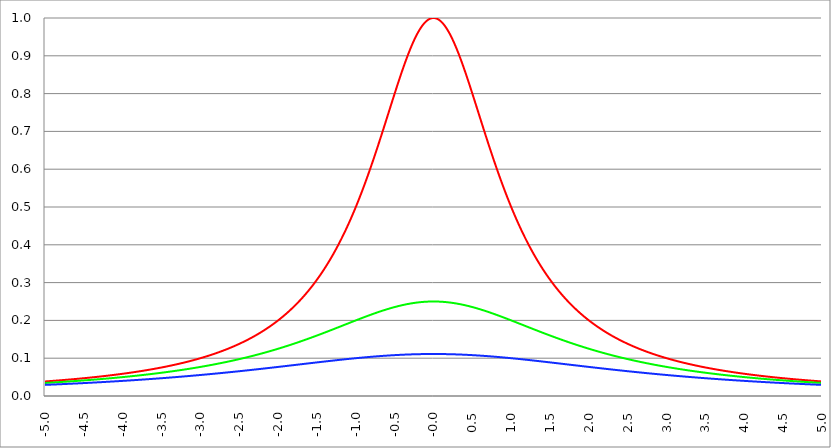
| Category | Series 1 | Series 0 | Series 2 |
|---|---|---|---|
| -5.0 | 0.038 | 0.034 | 0.029 |
| -4.995 | 0.039 | 0.035 | 0.029 |
| -4.99 | 0.039 | 0.035 | 0.029 |
| -4.985 | 0.039 | 0.035 | 0.03 |
| -4.98 | 0.039 | 0.035 | 0.03 |
| -4.975 | 0.039 | 0.035 | 0.03 |
| -4.97 | 0.039 | 0.035 | 0.03 |
| -4.965000000000001 | 0.039 | 0.035 | 0.03 |
| -4.960000000000001 | 0.039 | 0.035 | 0.03 |
| -4.955000000000001 | 0.039 | 0.035 | 0.03 |
| -4.950000000000001 | 0.039 | 0.035 | 0.03 |
| -4.945000000000001 | 0.039 | 0.035 | 0.03 |
| -4.940000000000001 | 0.039 | 0.035 | 0.03 |
| -4.935000000000001 | 0.039 | 0.035 | 0.03 |
| -4.930000000000001 | 0.04 | 0.035 | 0.03 |
| -4.925000000000002 | 0.04 | 0.035 | 0.03 |
| -4.920000000000002 | 0.04 | 0.035 | 0.03 |
| -4.915000000000002 | 0.04 | 0.036 | 0.03 |
| -4.910000000000002 | 0.04 | 0.036 | 0.03 |
| -4.905000000000002 | 0.04 | 0.036 | 0.03 |
| -4.900000000000002 | 0.04 | 0.036 | 0.03 |
| -4.895000000000002 | 0.04 | 0.036 | 0.03 |
| -4.890000000000002 | 0.04 | 0.036 | 0.03 |
| -4.885000000000002 | 0.04 | 0.036 | 0.03 |
| -4.880000000000002 | 0.04 | 0.036 | 0.03 |
| -4.875000000000003 | 0.04 | 0.036 | 0.031 |
| -4.870000000000003 | 0.04 | 0.036 | 0.031 |
| -4.865000000000003 | 0.041 | 0.036 | 0.031 |
| -4.860000000000003 | 0.041 | 0.036 | 0.031 |
| -4.855000000000003 | 0.041 | 0.036 | 0.031 |
| -4.850000000000003 | 0.041 | 0.036 | 0.031 |
| -4.845000000000003 | 0.041 | 0.036 | 0.031 |
| -4.840000000000003 | 0.041 | 0.036 | 0.031 |
| -4.835000000000003 | 0.041 | 0.037 | 0.031 |
| -4.830000000000004 | 0.041 | 0.037 | 0.031 |
| -4.825000000000004 | 0.041 | 0.037 | 0.031 |
| -4.820000000000004 | 0.041 | 0.037 | 0.031 |
| -4.815000000000004 | 0.041 | 0.037 | 0.031 |
| -4.810000000000004 | 0.041 | 0.037 | 0.031 |
| -4.805000000000004 | 0.042 | 0.037 | 0.031 |
| -4.800000000000004 | 0.042 | 0.037 | 0.031 |
| -4.795000000000004 | 0.042 | 0.037 | 0.031 |
| -4.790000000000004 | 0.042 | 0.037 | 0.031 |
| -4.785000000000004 | 0.042 | 0.037 | 0.031 |
| -4.780000000000004 | 0.042 | 0.037 | 0.031 |
| -4.775000000000004 | 0.042 | 0.037 | 0.031 |
| -4.770000000000004 | 0.042 | 0.037 | 0.031 |
| -4.765000000000005 | 0.042 | 0.037 | 0.032 |
| -4.760000000000005 | 0.042 | 0.038 | 0.032 |
| -4.755000000000005 | 0.042 | 0.038 | 0.032 |
| -4.750000000000005 | 0.042 | 0.038 | 0.032 |
| -4.745000000000005 | 0.043 | 0.038 | 0.032 |
| -4.740000000000005 | 0.043 | 0.038 | 0.032 |
| -4.735000000000005 | 0.043 | 0.038 | 0.032 |
| -4.730000000000005 | 0.043 | 0.038 | 0.032 |
| -4.725000000000006 | 0.043 | 0.038 | 0.032 |
| -4.720000000000006 | 0.043 | 0.038 | 0.032 |
| -4.715000000000006 | 0.043 | 0.038 | 0.032 |
| -4.710000000000006 | 0.043 | 0.038 | 0.032 |
| -4.705000000000006 | 0.043 | 0.038 | 0.032 |
| -4.700000000000006 | 0.043 | 0.038 | 0.032 |
| -4.695000000000006 | 0.043 | 0.038 | 0.032 |
| -4.690000000000006 | 0.043 | 0.038 | 0.032 |
| -4.685000000000007 | 0.044 | 0.039 | 0.032 |
| -4.680000000000007 | 0.044 | 0.039 | 0.032 |
| -4.675000000000007 | 0.044 | 0.039 | 0.032 |
| -4.670000000000007 | 0.044 | 0.039 | 0.032 |
| -4.665000000000007 | 0.044 | 0.039 | 0.033 |
| -4.660000000000007 | 0.044 | 0.039 | 0.033 |
| -4.655000000000007 | 0.044 | 0.039 | 0.033 |
| -4.650000000000007 | 0.044 | 0.039 | 0.033 |
| -4.645000000000007 | 0.044 | 0.039 | 0.033 |
| -4.640000000000008 | 0.044 | 0.039 | 0.033 |
| -4.635000000000008 | 0.044 | 0.039 | 0.033 |
| -4.630000000000008 | 0.045 | 0.039 | 0.033 |
| -4.625000000000008 | 0.045 | 0.039 | 0.033 |
| -4.620000000000008 | 0.045 | 0.039 | 0.033 |
| -4.615000000000008 | 0.045 | 0.04 | 0.033 |
| -4.610000000000008 | 0.045 | 0.04 | 0.033 |
| -4.605000000000008 | 0.045 | 0.04 | 0.033 |
| -4.600000000000008 | 0.045 | 0.04 | 0.033 |
| -4.595000000000009 | 0.045 | 0.04 | 0.033 |
| -4.590000000000009 | 0.045 | 0.04 | 0.033 |
| -4.585000000000009 | 0.045 | 0.04 | 0.033 |
| -4.580000000000009 | 0.046 | 0.04 | 0.033 |
| -4.57500000000001 | 0.046 | 0.04 | 0.033 |
| -4.57000000000001 | 0.046 | 0.04 | 0.033 |
| -4.565000000000009 | 0.046 | 0.04 | 0.034 |
| -4.560000000000009 | 0.046 | 0.04 | 0.034 |
| -4.555000000000009 | 0.046 | 0.04 | 0.034 |
| -4.55000000000001 | 0.046 | 0.04 | 0.034 |
| -4.54500000000001 | 0.046 | 0.041 | 0.034 |
| -4.54000000000001 | 0.046 | 0.041 | 0.034 |
| -4.53500000000001 | 0.046 | 0.041 | 0.034 |
| -4.53000000000001 | 0.046 | 0.041 | 0.034 |
| -4.52500000000001 | 0.047 | 0.041 | 0.034 |
| -4.52000000000001 | 0.047 | 0.041 | 0.034 |
| -4.51500000000001 | 0.047 | 0.041 | 0.034 |
| -4.51000000000001 | 0.047 | 0.041 | 0.034 |
| -4.505000000000011 | 0.047 | 0.041 | 0.034 |
| -4.500000000000011 | 0.047 | 0.041 | 0.034 |
| -4.495000000000011 | 0.047 | 0.041 | 0.034 |
| -4.490000000000011 | 0.047 | 0.041 | 0.034 |
| -4.485000000000011 | 0.047 | 0.041 | 0.034 |
| -4.480000000000011 | 0.047 | 0.042 | 0.034 |
| -4.475000000000011 | 0.048 | 0.042 | 0.034 |
| -4.470000000000011 | 0.048 | 0.042 | 0.035 |
| -4.465000000000011 | 0.048 | 0.042 | 0.035 |
| -4.460000000000011 | 0.048 | 0.042 | 0.035 |
| -4.455000000000012 | 0.048 | 0.042 | 0.035 |
| -4.450000000000012 | 0.048 | 0.042 | 0.035 |
| -4.445000000000012 | 0.048 | 0.042 | 0.035 |
| -4.440000000000012 | 0.048 | 0.042 | 0.035 |
| -4.435000000000012 | 0.048 | 0.042 | 0.035 |
| -4.430000000000012 | 0.048 | 0.042 | 0.035 |
| -4.425000000000012 | 0.049 | 0.042 | 0.035 |
| -4.420000000000012 | 0.049 | 0.042 | 0.035 |
| -4.415000000000012 | 0.049 | 0.043 | 0.035 |
| -4.410000000000013 | 0.049 | 0.043 | 0.035 |
| -4.405000000000013 | 0.049 | 0.043 | 0.035 |
| -4.400000000000013 | 0.049 | 0.043 | 0.035 |
| -4.395000000000013 | 0.049 | 0.043 | 0.035 |
| -4.390000000000013 | 0.049 | 0.043 | 0.035 |
| -4.385000000000013 | 0.049 | 0.043 | 0.035 |
| -4.380000000000013 | 0.05 | 0.043 | 0.035 |
| -4.375000000000013 | 0.05 | 0.043 | 0.036 |
| -4.370000000000013 | 0.05 | 0.043 | 0.036 |
| -4.365000000000013 | 0.05 | 0.043 | 0.036 |
| -4.360000000000014 | 0.05 | 0.043 | 0.036 |
| -4.355000000000014 | 0.05 | 0.044 | 0.036 |
| -4.350000000000014 | 0.05 | 0.044 | 0.036 |
| -4.345000000000014 | 0.05 | 0.044 | 0.036 |
| -4.340000000000014 | 0.05 | 0.044 | 0.036 |
| -4.335000000000014 | 0.051 | 0.044 | 0.036 |
| -4.330000000000014 | 0.051 | 0.044 | 0.036 |
| -4.325000000000014 | 0.051 | 0.044 | 0.036 |
| -4.320000000000014 | 0.051 | 0.044 | 0.036 |
| -4.315000000000015 | 0.051 | 0.044 | 0.036 |
| -4.310000000000015 | 0.051 | 0.044 | 0.036 |
| -4.305000000000015 | 0.051 | 0.044 | 0.036 |
| -4.300000000000015 | 0.051 | 0.044 | 0.036 |
| -4.295000000000015 | 0.051 | 0.045 | 0.036 |
| -4.290000000000015 | 0.052 | 0.045 | 0.036 |
| -4.285000000000015 | 0.052 | 0.045 | 0.037 |
| -4.280000000000015 | 0.052 | 0.045 | 0.037 |
| -4.275000000000015 | 0.052 | 0.045 | 0.037 |
| -4.270000000000015 | 0.052 | 0.045 | 0.037 |
| -4.265000000000016 | 0.052 | 0.045 | 0.037 |
| -4.260000000000016 | 0.052 | 0.045 | 0.037 |
| -4.255000000000016 | 0.052 | 0.045 | 0.037 |
| -4.250000000000016 | 0.052 | 0.045 | 0.037 |
| -4.245000000000016 | 0.053 | 0.045 | 0.037 |
| -4.240000000000016 | 0.053 | 0.046 | 0.037 |
| -4.235000000000016 | 0.053 | 0.046 | 0.037 |
| -4.230000000000016 | 0.053 | 0.046 | 0.037 |
| -4.225000000000017 | 0.053 | 0.046 | 0.037 |
| -4.220000000000017 | 0.053 | 0.046 | 0.037 |
| -4.215000000000017 | 0.053 | 0.046 | 0.037 |
| -4.210000000000017 | 0.053 | 0.046 | 0.037 |
| -4.205000000000017 | 0.054 | 0.046 | 0.037 |
| -4.200000000000017 | 0.054 | 0.046 | 0.038 |
| -4.195000000000017 | 0.054 | 0.046 | 0.038 |
| -4.190000000000017 | 0.054 | 0.046 | 0.038 |
| -4.185000000000017 | 0.054 | 0.046 | 0.038 |
| -4.180000000000017 | 0.054 | 0.047 | 0.038 |
| -4.175000000000018 | 0.054 | 0.047 | 0.038 |
| -4.170000000000018 | 0.054 | 0.047 | 0.038 |
| -4.165000000000018 | 0.055 | 0.047 | 0.038 |
| -4.160000000000018 | 0.055 | 0.047 | 0.038 |
| -4.155000000000018 | 0.055 | 0.047 | 0.038 |
| -4.150000000000018 | 0.055 | 0.047 | 0.038 |
| -4.145000000000018 | 0.055 | 0.047 | 0.038 |
| -4.140000000000018 | 0.055 | 0.047 | 0.038 |
| -4.135000000000018 | 0.055 | 0.047 | 0.038 |
| -4.130000000000019 | 0.055 | 0.047 | 0.038 |
| -4.125000000000019 | 0.056 | 0.048 | 0.038 |
| -4.120000000000019 | 0.056 | 0.048 | 0.038 |
| -4.115000000000019 | 0.056 | 0.048 | 0.039 |
| -4.110000000000019 | 0.056 | 0.048 | 0.039 |
| -4.105000000000019 | 0.056 | 0.048 | 0.039 |
| -4.100000000000019 | 0.056 | 0.048 | 0.039 |
| -4.095000000000019 | 0.056 | 0.048 | 0.039 |
| -4.090000000000019 | 0.056 | 0.048 | 0.039 |
| -4.085000000000019 | 0.057 | 0.048 | 0.039 |
| -4.08000000000002 | 0.057 | 0.048 | 0.039 |
| -4.07500000000002 | 0.057 | 0.049 | 0.039 |
| -4.07000000000002 | 0.057 | 0.049 | 0.039 |
| -4.06500000000002 | 0.057 | 0.049 | 0.039 |
| -4.06000000000002 | 0.057 | 0.049 | 0.039 |
| -4.05500000000002 | 0.057 | 0.049 | 0.039 |
| -4.05000000000002 | 0.057 | 0.049 | 0.039 |
| -4.04500000000002 | 0.058 | 0.049 | 0.039 |
| -4.04000000000002 | 0.058 | 0.049 | 0.039 |
| -4.03500000000002 | 0.058 | 0.049 | 0.04 |
| -4.03000000000002 | 0.058 | 0.049 | 0.04 |
| -4.025000000000021 | 0.058 | 0.05 | 0.04 |
| -4.020000000000021 | 0.058 | 0.05 | 0.04 |
| -4.015000000000021 | 0.058 | 0.05 | 0.04 |
| -4.010000000000021 | 0.059 | 0.05 | 0.04 |
| -4.005000000000021 | 0.059 | 0.05 | 0.04 |
| -4.000000000000021 | 0.059 | 0.05 | 0.04 |
| -3.995000000000021 | 0.059 | 0.05 | 0.04 |
| -3.990000000000021 | 0.059 | 0.05 | 0.04 |
| -3.985000000000022 | 0.059 | 0.05 | 0.04 |
| -3.980000000000022 | 0.059 | 0.05 | 0.04 |
| -3.975000000000022 | 0.06 | 0.051 | 0.04 |
| -3.970000000000022 | 0.06 | 0.051 | 0.04 |
| -3.965000000000022 | 0.06 | 0.051 | 0.04 |
| -3.960000000000022 | 0.06 | 0.051 | 0.041 |
| -3.955000000000022 | 0.06 | 0.051 | 0.041 |
| -3.950000000000022 | 0.06 | 0.051 | 0.041 |
| -3.945000000000022 | 0.06 | 0.051 | 0.041 |
| -3.940000000000023 | 0.061 | 0.051 | 0.041 |
| -3.935000000000023 | 0.061 | 0.051 | 0.041 |
| -3.930000000000023 | 0.061 | 0.051 | 0.041 |
| -3.925000000000023 | 0.061 | 0.052 | 0.041 |
| -3.920000000000023 | 0.061 | 0.052 | 0.041 |
| -3.915000000000023 | 0.061 | 0.052 | 0.041 |
| -3.910000000000023 | 0.061 | 0.052 | 0.041 |
| -3.905000000000023 | 0.062 | 0.052 | 0.041 |
| -3.900000000000023 | 0.062 | 0.052 | 0.041 |
| -3.895000000000023 | 0.062 | 0.052 | 0.041 |
| -3.890000000000024 | 0.062 | 0.052 | 0.041 |
| -3.885000000000024 | 0.062 | 0.052 | 0.042 |
| -3.880000000000024 | 0.062 | 0.052 | 0.042 |
| -3.875000000000024 | 0.062 | 0.053 | 0.042 |
| -3.870000000000024 | 0.063 | 0.053 | 0.042 |
| -3.865000000000024 | 0.063 | 0.053 | 0.042 |
| -3.860000000000024 | 0.063 | 0.053 | 0.042 |
| -3.855000000000024 | 0.063 | 0.053 | 0.042 |
| -3.850000000000024 | 0.063 | 0.053 | 0.042 |
| -3.845000000000025 | 0.063 | 0.053 | 0.042 |
| -3.840000000000025 | 0.064 | 0.053 | 0.042 |
| -3.835000000000025 | 0.064 | 0.053 | 0.042 |
| -3.830000000000025 | 0.064 | 0.054 | 0.042 |
| -3.825000000000025 | 0.064 | 0.054 | 0.042 |
| -3.820000000000025 | 0.064 | 0.054 | 0.042 |
| -3.815000000000025 | 0.064 | 0.054 | 0.042 |
| -3.810000000000025 | 0.064 | 0.054 | 0.043 |
| -3.805000000000025 | 0.065 | 0.054 | 0.043 |
| -3.800000000000026 | 0.065 | 0.054 | 0.043 |
| -3.795000000000026 | 0.065 | 0.054 | 0.043 |
| -3.790000000000026 | 0.065 | 0.054 | 0.043 |
| -3.785000000000026 | 0.065 | 0.055 | 0.043 |
| -3.780000000000026 | 0.065 | 0.055 | 0.043 |
| -3.775000000000026 | 0.066 | 0.055 | 0.043 |
| -3.770000000000026 | 0.066 | 0.055 | 0.043 |
| -3.765000000000026 | 0.066 | 0.055 | 0.043 |
| -3.760000000000026 | 0.066 | 0.055 | 0.043 |
| -3.755000000000026 | 0.066 | 0.055 | 0.043 |
| -3.750000000000027 | 0.066 | 0.055 | 0.043 |
| -3.745000000000027 | 0.067 | 0.055 | 0.043 |
| -3.740000000000027 | 0.067 | 0.056 | 0.044 |
| -3.735000000000027 | 0.067 | 0.056 | 0.044 |
| -3.730000000000027 | 0.067 | 0.056 | 0.044 |
| -3.725000000000027 | 0.067 | 0.056 | 0.044 |
| -3.720000000000027 | 0.067 | 0.056 | 0.044 |
| -3.715000000000027 | 0.068 | 0.056 | 0.044 |
| -3.710000000000027 | 0.068 | 0.056 | 0.044 |
| -3.705000000000028 | 0.068 | 0.056 | 0.044 |
| -3.700000000000028 | 0.068 | 0.057 | 0.044 |
| -3.695000000000028 | 0.068 | 0.057 | 0.044 |
| -3.690000000000028 | 0.068 | 0.057 | 0.044 |
| -3.685000000000028 | 0.069 | 0.057 | 0.044 |
| -3.680000000000028 | 0.069 | 0.057 | 0.044 |
| -3.675000000000028 | 0.069 | 0.057 | 0.044 |
| -3.670000000000028 | 0.069 | 0.057 | 0.045 |
| -3.665000000000028 | 0.069 | 0.057 | 0.045 |
| -3.660000000000028 | 0.069 | 0.057 | 0.045 |
| -3.655000000000029 | 0.07 | 0.058 | 0.045 |
| -3.650000000000029 | 0.07 | 0.058 | 0.045 |
| -3.645000000000029 | 0.07 | 0.058 | 0.045 |
| -3.640000000000029 | 0.07 | 0.058 | 0.045 |
| -3.635000000000029 | 0.07 | 0.058 | 0.045 |
| -3.630000000000029 | 0.071 | 0.058 | 0.045 |
| -3.625000000000029 | 0.071 | 0.058 | 0.045 |
| -3.620000000000029 | 0.071 | 0.058 | 0.045 |
| -3.615000000000029 | 0.071 | 0.059 | 0.045 |
| -3.61000000000003 | 0.071 | 0.059 | 0.045 |
| -3.60500000000003 | 0.071 | 0.059 | 0.045 |
| -3.60000000000003 | 0.072 | 0.059 | 0.046 |
| -3.59500000000003 | 0.072 | 0.059 | 0.046 |
| -3.59000000000003 | 0.072 | 0.059 | 0.046 |
| -3.58500000000003 | 0.072 | 0.059 | 0.046 |
| -3.58000000000003 | 0.072 | 0.059 | 0.046 |
| -3.57500000000003 | 0.073 | 0.06 | 0.046 |
| -3.57000000000003 | 0.073 | 0.06 | 0.046 |
| -3.565000000000031 | 0.073 | 0.06 | 0.046 |
| -3.560000000000031 | 0.073 | 0.06 | 0.046 |
| -3.555000000000031 | 0.073 | 0.06 | 0.046 |
| -3.550000000000031 | 0.074 | 0.06 | 0.046 |
| -3.545000000000031 | 0.074 | 0.06 | 0.046 |
| -3.540000000000031 | 0.074 | 0.06 | 0.046 |
| -3.535000000000031 | 0.074 | 0.061 | 0.047 |
| -3.530000000000031 | 0.074 | 0.061 | 0.047 |
| -3.525000000000031 | 0.074 | 0.061 | 0.047 |
| -3.520000000000032 | 0.075 | 0.061 | 0.047 |
| -3.515000000000032 | 0.075 | 0.061 | 0.047 |
| -3.510000000000032 | 0.075 | 0.061 | 0.047 |
| -3.505000000000032 | 0.075 | 0.061 | 0.047 |
| -3.500000000000032 | 0.075 | 0.062 | 0.047 |
| -3.495000000000032 | 0.076 | 0.062 | 0.047 |
| -3.490000000000032 | 0.076 | 0.062 | 0.047 |
| -3.485000000000032 | 0.076 | 0.062 | 0.047 |
| -3.480000000000032 | 0.076 | 0.062 | 0.047 |
| -3.475000000000032 | 0.076 | 0.062 | 0.047 |
| -3.470000000000033 | 0.077 | 0.062 | 0.048 |
| -3.465000000000033 | 0.077 | 0.062 | 0.048 |
| -3.460000000000033 | 0.077 | 0.063 | 0.048 |
| -3.455000000000033 | 0.077 | 0.063 | 0.048 |
| -3.450000000000033 | 0.078 | 0.063 | 0.048 |
| -3.445000000000033 | 0.078 | 0.063 | 0.048 |
| -3.440000000000033 | 0.078 | 0.063 | 0.048 |
| -3.435000000000033 | 0.078 | 0.063 | 0.048 |
| -3.430000000000033 | 0.078 | 0.063 | 0.048 |
| -3.425000000000034 | 0.079 | 0.064 | 0.048 |
| -3.420000000000034 | 0.079 | 0.064 | 0.048 |
| -3.415000000000034 | 0.079 | 0.064 | 0.048 |
| -3.410000000000034 | 0.079 | 0.064 | 0.048 |
| -3.405000000000034 | 0.079 | 0.064 | 0.049 |
| -3.400000000000034 | 0.08 | 0.064 | 0.049 |
| -3.395000000000034 | 0.08 | 0.064 | 0.049 |
| -3.390000000000034 | 0.08 | 0.065 | 0.049 |
| -3.385000000000034 | 0.08 | 0.065 | 0.049 |
| -3.380000000000034 | 0.08 | 0.065 | 0.049 |
| -3.375000000000035 | 0.081 | 0.065 | 0.049 |
| -3.370000000000035 | 0.081 | 0.065 | 0.049 |
| -3.365000000000035 | 0.081 | 0.065 | 0.049 |
| -3.360000000000035 | 0.081 | 0.065 | 0.049 |
| -3.355000000000035 | 0.082 | 0.066 | 0.049 |
| -3.350000000000035 | 0.082 | 0.066 | 0.049 |
| -3.345000000000035 | 0.082 | 0.066 | 0.05 |
| -3.340000000000035 | 0.082 | 0.066 | 0.05 |
| -3.335000000000035 | 0.082 | 0.066 | 0.05 |
| -3.330000000000036 | 0.083 | 0.066 | 0.05 |
| -3.325000000000036 | 0.083 | 0.066 | 0.05 |
| -3.320000000000036 | 0.083 | 0.067 | 0.05 |
| -3.315000000000036 | 0.083 | 0.067 | 0.05 |
| -3.310000000000036 | 0.084 | 0.067 | 0.05 |
| -3.305000000000036 | 0.084 | 0.067 | 0.05 |
| -3.300000000000036 | 0.084 | 0.067 | 0.05 |
| -3.295000000000036 | 0.084 | 0.067 | 0.05 |
| -3.290000000000036 | 0.085 | 0.067 | 0.05 |
| -3.285000000000036 | 0.085 | 0.068 | 0.051 |
| -3.280000000000036 | 0.085 | 0.068 | 0.051 |
| -3.275000000000037 | 0.085 | 0.068 | 0.051 |
| -3.270000000000037 | 0.086 | 0.068 | 0.051 |
| -3.265000000000037 | 0.086 | 0.068 | 0.051 |
| -3.260000000000037 | 0.086 | 0.068 | 0.051 |
| -3.255000000000037 | 0.086 | 0.069 | 0.051 |
| -3.250000000000037 | 0.086 | 0.069 | 0.051 |
| -3.245000000000037 | 0.087 | 0.069 | 0.051 |
| -3.240000000000037 | 0.087 | 0.069 | 0.051 |
| -3.235000000000038 | 0.087 | 0.069 | 0.051 |
| -3.230000000000038 | 0.087 | 0.069 | 0.051 |
| -3.225000000000038 | 0.088 | 0.069 | 0.052 |
| -3.220000000000038 | 0.088 | 0.07 | 0.052 |
| -3.215000000000038 | 0.088 | 0.07 | 0.052 |
| -3.210000000000038 | 0.088 | 0.07 | 0.052 |
| -3.205000000000038 | 0.089 | 0.07 | 0.052 |
| -3.200000000000038 | 0.089 | 0.07 | 0.052 |
| -3.195000000000038 | 0.089 | 0.07 | 0.052 |
| -3.190000000000039 | 0.089 | 0.071 | 0.052 |
| -3.185000000000039 | 0.09 | 0.071 | 0.052 |
| -3.180000000000039 | 0.09 | 0.071 | 0.052 |
| -3.175000000000039 | 0.09 | 0.071 | 0.052 |
| -3.170000000000039 | 0.091 | 0.071 | 0.052 |
| -3.16500000000004 | 0.091 | 0.071 | 0.053 |
| -3.16000000000004 | 0.091 | 0.072 | 0.053 |
| -3.155000000000039 | 0.091 | 0.072 | 0.053 |
| -3.150000000000039 | 0.092 | 0.072 | 0.053 |
| -3.14500000000004 | 0.092 | 0.072 | 0.053 |
| -3.14000000000004 | 0.092 | 0.072 | 0.053 |
| -3.13500000000004 | 0.092 | 0.072 | 0.053 |
| -3.13000000000004 | 0.093 | 0.072 | 0.053 |
| -3.12500000000004 | 0.093 | 0.073 | 0.053 |
| -3.12000000000004 | 0.093 | 0.073 | 0.053 |
| -3.11500000000004 | 0.093 | 0.073 | 0.053 |
| -3.11000000000004 | 0.094 | 0.073 | 0.054 |
| -3.10500000000004 | 0.094 | 0.073 | 0.054 |
| -3.10000000000004 | 0.094 | 0.073 | 0.054 |
| -3.095000000000041 | 0.095 | 0.074 | 0.054 |
| -3.090000000000041 | 0.095 | 0.074 | 0.054 |
| -3.085000000000041 | 0.095 | 0.074 | 0.054 |
| -3.080000000000041 | 0.095 | 0.074 | 0.054 |
| -3.075000000000041 | 0.096 | 0.074 | 0.054 |
| -3.070000000000041 | 0.096 | 0.074 | 0.054 |
| -3.065000000000041 | 0.096 | 0.075 | 0.054 |
| -3.060000000000041 | 0.096 | 0.075 | 0.054 |
| -3.055000000000041 | 0.097 | 0.075 | 0.055 |
| -3.050000000000042 | 0.097 | 0.075 | 0.055 |
| -3.045000000000042 | 0.097 | 0.075 | 0.055 |
| -3.040000000000042 | 0.098 | 0.076 | 0.055 |
| -3.035000000000042 | 0.098 | 0.076 | 0.055 |
| -3.030000000000042 | 0.098 | 0.076 | 0.055 |
| -3.025000000000042 | 0.099 | 0.076 | 0.055 |
| -3.020000000000042 | 0.099 | 0.076 | 0.055 |
| -3.015000000000042 | 0.099 | 0.076 | 0.055 |
| -3.010000000000042 | 0.099 | 0.077 | 0.055 |
| -3.005000000000043 | 0.1 | 0.077 | 0.055 |
| -3.000000000000043 | 0.1 | 0.077 | 0.056 |
| -2.995000000000043 | 0.1 | 0.077 | 0.056 |
| -2.990000000000043 | 0.101 | 0.077 | 0.056 |
| -2.985000000000043 | 0.101 | 0.077 | 0.056 |
| -2.980000000000043 | 0.101 | 0.078 | 0.056 |
| -2.975000000000043 | 0.102 | 0.078 | 0.056 |
| -2.970000000000043 | 0.102 | 0.078 | 0.056 |
| -2.965000000000043 | 0.102 | 0.078 | 0.056 |
| -2.960000000000043 | 0.102 | 0.078 | 0.056 |
| -2.955000000000044 | 0.103 | 0.079 | 0.056 |
| -2.950000000000044 | 0.103 | 0.079 | 0.056 |
| -2.945000000000044 | 0.103 | 0.079 | 0.057 |
| -2.940000000000044 | 0.104 | 0.079 | 0.057 |
| -2.935000000000044 | 0.104 | 0.079 | 0.057 |
| -2.930000000000044 | 0.104 | 0.079 | 0.057 |
| -2.925000000000044 | 0.105 | 0.08 | 0.057 |
| -2.920000000000044 | 0.105 | 0.08 | 0.057 |
| -2.915000000000044 | 0.105 | 0.08 | 0.057 |
| -2.910000000000045 | 0.106 | 0.08 | 0.057 |
| -2.905000000000045 | 0.106 | 0.08 | 0.057 |
| -2.900000000000045 | 0.106 | 0.081 | 0.057 |
| -2.895000000000045 | 0.107 | 0.081 | 0.058 |
| -2.890000000000045 | 0.107 | 0.081 | 0.058 |
| -2.885000000000045 | 0.107 | 0.081 | 0.058 |
| -2.880000000000045 | 0.108 | 0.081 | 0.058 |
| -2.875000000000045 | 0.108 | 0.082 | 0.058 |
| -2.870000000000045 | 0.108 | 0.082 | 0.058 |
| -2.865000000000045 | 0.109 | 0.082 | 0.058 |
| -2.860000000000046 | 0.109 | 0.082 | 0.058 |
| -2.855000000000046 | 0.109 | 0.082 | 0.058 |
| -2.850000000000046 | 0.11 | 0.082 | 0.058 |
| -2.845000000000046 | 0.11 | 0.083 | 0.058 |
| -2.840000000000046 | 0.11 | 0.083 | 0.059 |
| -2.835000000000046 | 0.111 | 0.083 | 0.059 |
| -2.830000000000046 | 0.111 | 0.083 | 0.059 |
| -2.825000000000046 | 0.111 | 0.083 | 0.059 |
| -2.820000000000046 | 0.112 | 0.084 | 0.059 |
| -2.815000000000047 | 0.112 | 0.084 | 0.059 |
| -2.810000000000047 | 0.112 | 0.084 | 0.059 |
| -2.805000000000047 | 0.113 | 0.084 | 0.059 |
| -2.800000000000047 | 0.113 | 0.084 | 0.059 |
| -2.795000000000047 | 0.113 | 0.085 | 0.059 |
| -2.790000000000047 | 0.114 | 0.085 | 0.06 |
| -2.785000000000047 | 0.114 | 0.085 | 0.06 |
| -2.780000000000047 | 0.115 | 0.085 | 0.06 |
| -2.775000000000047 | 0.115 | 0.085 | 0.06 |
| -2.770000000000047 | 0.115 | 0.086 | 0.06 |
| -2.765000000000048 | 0.116 | 0.086 | 0.06 |
| -2.760000000000048 | 0.116 | 0.086 | 0.06 |
| -2.755000000000048 | 0.116 | 0.086 | 0.06 |
| -2.750000000000048 | 0.117 | 0.086 | 0.06 |
| -2.745000000000048 | 0.117 | 0.087 | 0.06 |
| -2.740000000000048 | 0.118 | 0.087 | 0.061 |
| -2.735000000000048 | 0.118 | 0.087 | 0.061 |
| -2.730000000000048 | 0.118 | 0.087 | 0.061 |
| -2.725000000000048 | 0.119 | 0.088 | 0.061 |
| -2.720000000000049 | 0.119 | 0.088 | 0.061 |
| -2.715000000000049 | 0.119 | 0.088 | 0.061 |
| -2.710000000000049 | 0.12 | 0.088 | 0.061 |
| -2.705000000000049 | 0.12 | 0.088 | 0.061 |
| -2.700000000000049 | 0.121 | 0.089 | 0.061 |
| -2.695000000000049 | 0.121 | 0.089 | 0.061 |
| -2.690000000000049 | 0.121 | 0.089 | 0.062 |
| -2.685000000000049 | 0.122 | 0.089 | 0.062 |
| -2.680000000000049 | 0.122 | 0.089 | 0.062 |
| -2.675000000000049 | 0.123 | 0.09 | 0.062 |
| -2.67000000000005 | 0.123 | 0.09 | 0.062 |
| -2.66500000000005 | 0.123 | 0.09 | 0.062 |
| -2.66000000000005 | 0.124 | 0.09 | 0.062 |
| -2.65500000000005 | 0.124 | 0.091 | 0.062 |
| -2.65000000000005 | 0.125 | 0.091 | 0.062 |
| -2.64500000000005 | 0.125 | 0.091 | 0.063 |
| -2.64000000000005 | 0.125 | 0.091 | 0.063 |
| -2.63500000000005 | 0.126 | 0.091 | 0.063 |
| -2.63000000000005 | 0.126 | 0.092 | 0.063 |
| -2.625000000000051 | 0.127 | 0.092 | 0.063 |
| -2.620000000000051 | 0.127 | 0.092 | 0.063 |
| -2.615000000000051 | 0.128 | 0.092 | 0.063 |
| -2.610000000000051 | 0.128 | 0.092 | 0.063 |
| -2.605000000000051 | 0.128 | 0.093 | 0.063 |
| -2.600000000000051 | 0.129 | 0.093 | 0.063 |
| -2.595000000000051 | 0.129 | 0.093 | 0.064 |
| -2.590000000000051 | 0.13 | 0.093 | 0.064 |
| -2.585000000000051 | 0.13 | 0.094 | 0.064 |
| -2.580000000000052 | 0.131 | 0.094 | 0.064 |
| -2.575000000000052 | 0.131 | 0.094 | 0.064 |
| -2.570000000000052 | 0.131 | 0.094 | 0.064 |
| -2.565000000000052 | 0.132 | 0.095 | 0.064 |
| -2.560000000000052 | 0.132 | 0.095 | 0.064 |
| -2.555000000000052 | 0.133 | 0.095 | 0.064 |
| -2.550000000000052 | 0.133 | 0.095 | 0.065 |
| -2.545000000000052 | 0.134 | 0.095 | 0.065 |
| -2.540000000000052 | 0.134 | 0.096 | 0.065 |
| -2.535000000000053 | 0.135 | 0.096 | 0.065 |
| -2.530000000000053 | 0.135 | 0.096 | 0.065 |
| -2.525000000000053 | 0.136 | 0.096 | 0.065 |
| -2.520000000000053 | 0.136 | 0.097 | 0.065 |
| -2.515000000000053 | 0.137 | 0.097 | 0.065 |
| -2.510000000000053 | 0.137 | 0.097 | 0.065 |
| -2.505000000000053 | 0.137 | 0.097 | 0.065 |
| -2.500000000000053 | 0.138 | 0.098 | 0.066 |
| -2.495000000000053 | 0.138 | 0.098 | 0.066 |
| -2.490000000000053 | 0.139 | 0.098 | 0.066 |
| -2.485000000000054 | 0.139 | 0.098 | 0.066 |
| -2.480000000000054 | 0.14 | 0.099 | 0.066 |
| -2.475000000000054 | 0.14 | 0.099 | 0.066 |
| -2.470000000000054 | 0.141 | 0.099 | 0.066 |
| -2.465000000000054 | 0.141 | 0.099 | 0.066 |
| -2.460000000000054 | 0.142 | 0.099 | 0.066 |
| -2.455000000000054 | 0.142 | 0.1 | 0.067 |
| -2.450000000000054 | 0.143 | 0.1 | 0.067 |
| -2.445000000000054 | 0.143 | 0.1 | 0.067 |
| -2.440000000000055 | 0.144 | 0.1 | 0.067 |
| -2.435000000000055 | 0.144 | 0.101 | 0.067 |
| -2.430000000000055 | 0.145 | 0.101 | 0.067 |
| -2.425000000000055 | 0.145 | 0.101 | 0.067 |
| -2.420000000000055 | 0.146 | 0.101 | 0.067 |
| -2.415000000000055 | 0.146 | 0.102 | 0.067 |
| -2.410000000000055 | 0.147 | 0.102 | 0.068 |
| -2.405000000000055 | 0.147 | 0.102 | 0.068 |
| -2.400000000000055 | 0.148 | 0.102 | 0.068 |
| -2.395000000000055 | 0.148 | 0.103 | 0.068 |
| -2.390000000000056 | 0.149 | 0.103 | 0.068 |
| -2.385000000000056 | 0.15 | 0.103 | 0.068 |
| -2.380000000000056 | 0.15 | 0.103 | 0.068 |
| -2.375000000000056 | 0.151 | 0.104 | 0.068 |
| -2.370000000000056 | 0.151 | 0.104 | 0.068 |
| -2.365000000000056 | 0.152 | 0.104 | 0.069 |
| -2.360000000000056 | 0.152 | 0.104 | 0.069 |
| -2.355000000000056 | 0.153 | 0.105 | 0.069 |
| -2.350000000000056 | 0.153 | 0.105 | 0.069 |
| -2.345000000000057 | 0.154 | 0.105 | 0.069 |
| -2.340000000000057 | 0.154 | 0.106 | 0.069 |
| -2.335000000000057 | 0.155 | 0.106 | 0.069 |
| -2.330000000000057 | 0.156 | 0.106 | 0.069 |
| -2.325000000000057 | 0.156 | 0.106 | 0.069 |
| -2.320000000000057 | 0.157 | 0.107 | 0.07 |
| -2.315000000000057 | 0.157 | 0.107 | 0.07 |
| -2.310000000000057 | 0.158 | 0.107 | 0.07 |
| -2.305000000000057 | 0.158 | 0.107 | 0.07 |
| -2.300000000000058 | 0.159 | 0.108 | 0.07 |
| -2.295000000000058 | 0.16 | 0.108 | 0.07 |
| -2.290000000000058 | 0.16 | 0.108 | 0.07 |
| -2.285000000000058 | 0.161 | 0.108 | 0.07 |
| -2.280000000000058 | 0.161 | 0.109 | 0.07 |
| -2.275000000000058 | 0.162 | 0.109 | 0.071 |
| -2.270000000000058 | 0.163 | 0.109 | 0.071 |
| -2.265000000000058 | 0.163 | 0.11 | 0.071 |
| -2.260000000000058 | 0.164 | 0.11 | 0.071 |
| -2.255000000000058 | 0.164 | 0.11 | 0.071 |
| -2.250000000000059 | 0.165 | 0.11 | 0.071 |
| -2.245000000000059 | 0.166 | 0.111 | 0.071 |
| -2.240000000000059 | 0.166 | 0.111 | 0.071 |
| -2.235000000000059 | 0.167 | 0.111 | 0.071 |
| -2.23000000000006 | 0.167 | 0.111 | 0.072 |
| -2.22500000000006 | 0.168 | 0.112 | 0.072 |
| -2.22000000000006 | 0.169 | 0.112 | 0.072 |
| -2.215000000000059 | 0.169 | 0.112 | 0.072 |
| -2.210000000000059 | 0.17 | 0.113 | 0.072 |
| -2.20500000000006 | 0.171 | 0.113 | 0.072 |
| -2.20000000000006 | 0.171 | 0.113 | 0.072 |
| -2.19500000000006 | 0.172 | 0.113 | 0.072 |
| -2.19000000000006 | 0.173 | 0.114 | 0.072 |
| -2.18500000000006 | 0.173 | 0.114 | 0.073 |
| -2.18000000000006 | 0.174 | 0.114 | 0.073 |
| -2.17500000000006 | 0.175 | 0.115 | 0.073 |
| -2.17000000000006 | 0.175 | 0.115 | 0.073 |
| -2.16500000000006 | 0.176 | 0.115 | 0.073 |
| -2.160000000000061 | 0.177 | 0.115 | 0.073 |
| -2.155000000000061 | 0.177 | 0.116 | 0.073 |
| -2.150000000000061 | 0.178 | 0.116 | 0.073 |
| -2.145000000000061 | 0.179 | 0.116 | 0.074 |
| -2.140000000000061 | 0.179 | 0.117 | 0.074 |
| -2.135000000000061 | 0.18 | 0.117 | 0.074 |
| -2.130000000000061 | 0.181 | 0.117 | 0.074 |
| -2.125000000000061 | 0.181 | 0.117 | 0.074 |
| -2.120000000000061 | 0.182 | 0.118 | 0.074 |
| -2.115000000000061 | 0.183 | 0.118 | 0.074 |
| -2.110000000000062 | 0.183 | 0.118 | 0.074 |
| -2.105000000000062 | 0.184 | 0.119 | 0.074 |
| -2.100000000000062 | 0.185 | 0.119 | 0.075 |
| -2.095000000000062 | 0.186 | 0.119 | 0.075 |
| -2.090000000000062 | 0.186 | 0.12 | 0.075 |
| -2.085000000000062 | 0.187 | 0.12 | 0.075 |
| -2.080000000000062 | 0.188 | 0.12 | 0.075 |
| -2.075000000000062 | 0.188 | 0.12 | 0.075 |
| -2.070000000000062 | 0.189 | 0.121 | 0.075 |
| -2.065000000000063 | 0.19 | 0.121 | 0.075 |
| -2.060000000000063 | 0.191 | 0.121 | 0.076 |
| -2.055000000000063 | 0.191 | 0.122 | 0.076 |
| -2.050000000000063 | 0.192 | 0.122 | 0.076 |
| -2.045000000000063 | 0.193 | 0.122 | 0.076 |
| -2.040000000000063 | 0.194 | 0.123 | 0.076 |
| -2.035000000000063 | 0.195 | 0.123 | 0.076 |
| -2.030000000000063 | 0.195 | 0.123 | 0.076 |
| -2.025000000000063 | 0.196 | 0.123 | 0.076 |
| -2.020000000000064 | 0.197 | 0.124 | 0.076 |
| -2.015000000000064 | 0.198 | 0.124 | 0.077 |
| -2.010000000000064 | 0.198 | 0.124 | 0.077 |
| -2.005000000000064 | 0.199 | 0.125 | 0.077 |
| -2.000000000000064 | 0.2 | 0.125 | 0.077 |
| -1.995000000000064 | 0.201 | 0.125 | 0.077 |
| -1.990000000000064 | 0.202 | 0.126 | 0.077 |
| -1.985000000000064 | 0.202 | 0.126 | 0.077 |
| -1.980000000000064 | 0.203 | 0.126 | 0.077 |
| -1.975000000000064 | 0.204 | 0.127 | 0.078 |
| -1.970000000000065 | 0.205 | 0.127 | 0.078 |
| -1.965000000000065 | 0.206 | 0.127 | 0.078 |
| -1.960000000000065 | 0.207 | 0.128 | 0.078 |
| -1.955000000000065 | 0.207 | 0.128 | 0.078 |
| -1.950000000000065 | 0.208 | 0.128 | 0.078 |
| -1.945000000000065 | 0.209 | 0.128 | 0.078 |
| -1.940000000000065 | 0.21 | 0.129 | 0.078 |
| -1.935000000000065 | 0.211 | 0.129 | 0.078 |
| -1.930000000000065 | 0.212 | 0.129 | 0.079 |
| -1.925000000000066 | 0.213 | 0.13 | 0.079 |
| -1.920000000000066 | 0.213 | 0.13 | 0.079 |
| -1.915000000000066 | 0.214 | 0.13 | 0.079 |
| -1.910000000000066 | 0.215 | 0.131 | 0.079 |
| -1.905000000000066 | 0.216 | 0.131 | 0.079 |
| -1.900000000000066 | 0.217 | 0.131 | 0.079 |
| -1.895000000000066 | 0.218 | 0.132 | 0.079 |
| -1.890000000000066 | 0.219 | 0.132 | 0.08 |
| -1.885000000000066 | 0.22 | 0.132 | 0.08 |
| -1.880000000000066 | 0.221 | 0.133 | 0.08 |
| -1.875000000000067 | 0.221 | 0.133 | 0.08 |
| -1.870000000000067 | 0.222 | 0.133 | 0.08 |
| -1.865000000000067 | 0.223 | 0.134 | 0.08 |
| -1.860000000000067 | 0.224 | 0.134 | 0.08 |
| -1.855000000000067 | 0.225 | 0.134 | 0.08 |
| -1.850000000000067 | 0.226 | 0.135 | 0.08 |
| -1.845000000000067 | 0.227 | 0.135 | 0.081 |
| -1.840000000000067 | 0.228 | 0.135 | 0.081 |
| -1.835000000000067 | 0.229 | 0.136 | 0.081 |
| -1.830000000000068 | 0.23 | 0.136 | 0.081 |
| -1.825000000000068 | 0.231 | 0.136 | 0.081 |
| -1.820000000000068 | 0.232 | 0.137 | 0.081 |
| -1.815000000000068 | 0.233 | 0.137 | 0.081 |
| -1.810000000000068 | 0.234 | 0.137 | 0.081 |
| -1.805000000000068 | 0.235 | 0.138 | 0.082 |
| -1.800000000000068 | 0.236 | 0.138 | 0.082 |
| -1.795000000000068 | 0.237 | 0.138 | 0.082 |
| -1.790000000000068 | 0.238 | 0.139 | 0.082 |
| -1.785000000000068 | 0.239 | 0.139 | 0.082 |
| -1.780000000000069 | 0.24 | 0.14 | 0.082 |
| -1.775000000000069 | 0.241 | 0.14 | 0.082 |
| -1.770000000000069 | 0.242 | 0.14 | 0.082 |
| -1.765000000000069 | 0.243 | 0.141 | 0.083 |
| -1.760000000000069 | 0.244 | 0.141 | 0.083 |
| -1.75500000000007 | 0.245 | 0.141 | 0.083 |
| -1.75000000000007 | 0.246 | 0.142 | 0.083 |
| -1.745000000000069 | 0.247 | 0.142 | 0.083 |
| -1.740000000000069 | 0.248 | 0.142 | 0.083 |
| -1.73500000000007 | 0.249 | 0.143 | 0.083 |
| -1.73000000000007 | 0.25 | 0.143 | 0.083 |
| -1.72500000000007 | 0.252 | 0.143 | 0.084 |
| -1.72000000000007 | 0.253 | 0.144 | 0.084 |
| -1.71500000000007 | 0.254 | 0.144 | 0.084 |
| -1.71000000000007 | 0.255 | 0.144 | 0.084 |
| -1.70500000000007 | 0.256 | 0.145 | 0.084 |
| -1.70000000000007 | 0.257 | 0.145 | 0.084 |
| -1.69500000000007 | 0.258 | 0.145 | 0.084 |
| -1.69000000000007 | 0.259 | 0.146 | 0.084 |
| -1.685000000000071 | 0.26 | 0.146 | 0.084 |
| -1.680000000000071 | 0.262 | 0.147 | 0.085 |
| -1.675000000000071 | 0.263 | 0.147 | 0.085 |
| -1.670000000000071 | 0.264 | 0.147 | 0.085 |
| -1.665000000000071 | 0.265 | 0.148 | 0.085 |
| -1.660000000000071 | 0.266 | 0.148 | 0.085 |
| -1.655000000000071 | 0.267 | 0.148 | 0.085 |
| -1.650000000000071 | 0.269 | 0.149 | 0.085 |
| -1.645000000000071 | 0.27 | 0.149 | 0.085 |
| -1.640000000000072 | 0.271 | 0.149 | 0.086 |
| -1.635000000000072 | 0.272 | 0.15 | 0.086 |
| -1.630000000000072 | 0.273 | 0.15 | 0.086 |
| -1.625000000000072 | 0.275 | 0.151 | 0.086 |
| -1.620000000000072 | 0.276 | 0.151 | 0.086 |
| -1.615000000000072 | 0.277 | 0.151 | 0.086 |
| -1.610000000000072 | 0.278 | 0.152 | 0.086 |
| -1.605000000000072 | 0.28 | 0.152 | 0.086 |
| -1.600000000000072 | 0.281 | 0.152 | 0.087 |
| -1.595000000000073 | 0.282 | 0.153 | 0.087 |
| -1.590000000000073 | 0.283 | 0.153 | 0.087 |
| -1.585000000000073 | 0.285 | 0.154 | 0.087 |
| -1.580000000000073 | 0.286 | 0.154 | 0.087 |
| -1.575000000000073 | 0.287 | 0.154 | 0.087 |
| -1.570000000000073 | 0.289 | 0.155 | 0.087 |
| -1.565000000000073 | 0.29 | 0.155 | 0.087 |
| -1.560000000000073 | 0.291 | 0.155 | 0.087 |
| -1.555000000000073 | 0.293 | 0.156 | 0.088 |
| -1.550000000000074 | 0.294 | 0.156 | 0.088 |
| -1.545000000000074 | 0.295 | 0.157 | 0.088 |
| -1.540000000000074 | 0.297 | 0.157 | 0.088 |
| -1.535000000000074 | 0.298 | 0.157 | 0.088 |
| -1.530000000000074 | 0.299 | 0.158 | 0.088 |
| -1.525000000000074 | 0.301 | 0.158 | 0.088 |
| -1.520000000000074 | 0.302 | 0.158 | 0.088 |
| -1.515000000000074 | 0.303 | 0.159 | 0.089 |
| -1.510000000000074 | 0.305 | 0.159 | 0.089 |
| -1.505000000000074 | 0.306 | 0.16 | 0.089 |
| -1.500000000000075 | 0.308 | 0.16 | 0.089 |
| -1.495000000000075 | 0.309 | 0.16 | 0.089 |
| -1.490000000000075 | 0.311 | 0.161 | 0.089 |
| -1.485000000000075 | 0.312 | 0.161 | 0.089 |
| -1.480000000000075 | 0.313 | 0.162 | 0.089 |
| -1.475000000000075 | 0.315 | 0.162 | 0.089 |
| -1.470000000000075 | 0.316 | 0.162 | 0.09 |
| -1.465000000000075 | 0.318 | 0.163 | 0.09 |
| -1.460000000000075 | 0.319 | 0.163 | 0.09 |
| -1.455000000000076 | 0.321 | 0.163 | 0.09 |
| -1.450000000000076 | 0.322 | 0.164 | 0.09 |
| -1.445000000000076 | 0.324 | 0.164 | 0.09 |
| -1.440000000000076 | 0.325 | 0.165 | 0.09 |
| -1.435000000000076 | 0.327 | 0.165 | 0.09 |
| -1.430000000000076 | 0.328 | 0.165 | 0.091 |
| -1.425000000000076 | 0.33 | 0.166 | 0.091 |
| -1.420000000000076 | 0.332 | 0.166 | 0.091 |
| -1.415000000000076 | 0.333 | 0.167 | 0.091 |
| -1.410000000000077 | 0.335 | 0.167 | 0.091 |
| -1.405000000000077 | 0.336 | 0.167 | 0.091 |
| -1.400000000000077 | 0.338 | 0.168 | 0.091 |
| -1.395000000000077 | 0.339 | 0.168 | 0.091 |
| -1.390000000000077 | 0.341 | 0.169 | 0.091 |
| -1.385000000000077 | 0.343 | 0.169 | 0.092 |
| -1.380000000000077 | 0.344 | 0.169 | 0.092 |
| -1.375000000000077 | 0.346 | 0.17 | 0.092 |
| -1.370000000000077 | 0.348 | 0.17 | 0.092 |
| -1.365000000000077 | 0.349 | 0.171 | 0.092 |
| -1.360000000000078 | 0.351 | 0.171 | 0.092 |
| -1.355000000000078 | 0.353 | 0.171 | 0.092 |
| -1.350000000000078 | 0.354 | 0.172 | 0.092 |
| -1.345000000000078 | 0.356 | 0.172 | 0.093 |
| -1.340000000000078 | 0.358 | 0.173 | 0.093 |
| -1.335000000000078 | 0.359 | 0.173 | 0.093 |
| -1.330000000000078 | 0.361 | 0.173 | 0.093 |
| -1.325000000000078 | 0.363 | 0.174 | 0.093 |
| -1.320000000000078 | 0.365 | 0.174 | 0.093 |
| -1.315000000000079 | 0.366 | 0.175 | 0.093 |
| -1.310000000000079 | 0.368 | 0.175 | 0.093 |
| -1.305000000000079 | 0.37 | 0.175 | 0.093 |
| -1.300000000000079 | 0.372 | 0.176 | 0.094 |
| -1.295000000000079 | 0.374 | 0.176 | 0.094 |
| -1.29000000000008 | 0.375 | 0.177 | 0.094 |
| -1.285000000000079 | 0.377 | 0.177 | 0.094 |
| -1.280000000000079 | 0.379 | 0.177 | 0.094 |
| -1.275000000000079 | 0.381 | 0.178 | 0.094 |
| -1.270000000000079 | 0.383 | 0.178 | 0.094 |
| -1.26500000000008 | 0.385 | 0.179 | 0.094 |
| -1.26000000000008 | 0.386 | 0.179 | 0.094 |
| -1.25500000000008 | 0.388 | 0.179 | 0.095 |
| -1.25000000000008 | 0.39 | 0.18 | 0.095 |
| -1.24500000000008 | 0.392 | 0.18 | 0.095 |
| -1.24000000000008 | 0.394 | 0.181 | 0.095 |
| -1.23500000000008 | 0.396 | 0.181 | 0.095 |
| -1.23000000000008 | 0.398 | 0.181 | 0.095 |
| -1.22500000000008 | 0.4 | 0.182 | 0.095 |
| -1.220000000000081 | 0.402 | 0.182 | 0.095 |
| -1.215000000000081 | 0.404 | 0.183 | 0.095 |
| -1.210000000000081 | 0.406 | 0.183 | 0.096 |
| -1.205000000000081 | 0.408 | 0.183 | 0.096 |
| -1.200000000000081 | 0.41 | 0.184 | 0.096 |
| -1.195000000000081 | 0.412 | 0.184 | 0.096 |
| -1.190000000000081 | 0.414 | 0.185 | 0.096 |
| -1.185000000000081 | 0.416 | 0.185 | 0.096 |
| -1.180000000000081 | 0.418 | 0.185 | 0.096 |
| -1.175000000000082 | 0.42 | 0.186 | 0.096 |
| -1.170000000000082 | 0.422 | 0.186 | 0.096 |
| -1.165000000000082 | 0.424 | 0.187 | 0.097 |
| -1.160000000000082 | 0.426 | 0.187 | 0.097 |
| -1.155000000000082 | 0.428 | 0.187 | 0.097 |
| -1.150000000000082 | 0.431 | 0.188 | 0.097 |
| -1.145000000000082 | 0.433 | 0.188 | 0.097 |
| -1.140000000000082 | 0.435 | 0.189 | 0.097 |
| -1.135000000000082 | 0.437 | 0.189 | 0.097 |
| -1.130000000000082 | 0.439 | 0.19 | 0.097 |
| -1.125000000000083 | 0.441 | 0.19 | 0.097 |
| -1.120000000000083 | 0.444 | 0.19 | 0.098 |
| -1.115000000000083 | 0.446 | 0.191 | 0.098 |
| -1.110000000000083 | 0.448 | 0.191 | 0.098 |
| -1.105000000000083 | 0.45 | 0.192 | 0.098 |
| -1.100000000000083 | 0.452 | 0.192 | 0.098 |
| -1.095000000000083 | 0.455 | 0.192 | 0.098 |
| -1.090000000000083 | 0.457 | 0.193 | 0.098 |
| -1.085000000000083 | 0.459 | 0.193 | 0.098 |
| -1.080000000000084 | 0.462 | 0.194 | 0.098 |
| -1.075000000000084 | 0.464 | 0.194 | 0.098 |
| -1.070000000000084 | 0.466 | 0.194 | 0.099 |
| -1.065000000000084 | 0.469 | 0.195 | 0.099 |
| -1.060000000000084 | 0.471 | 0.195 | 0.099 |
| -1.055000000000084 | 0.473 | 0.196 | 0.099 |
| -1.050000000000084 | 0.476 | 0.196 | 0.099 |
| -1.045000000000084 | 0.478 | 0.196 | 0.099 |
| -1.040000000000084 | 0.48 | 0.197 | 0.099 |
| -1.035000000000085 | 0.483 | 0.197 | 0.099 |
| -1.030000000000085 | 0.485 | 0.198 | 0.099 |
| -1.025000000000085 | 0.488 | 0.198 | 0.099 |
| -1.020000000000085 | 0.49 | 0.198 | 0.1 |
| -1.015000000000085 | 0.493 | 0.199 | 0.1 |
| -1.010000000000085 | 0.495 | 0.199 | 0.1 |
| -1.005000000000085 | 0.498 | 0.2 | 0.1 |
| -1.000000000000085 | 0.5 | 0.2 | 0.1 |
| -0.995000000000085 | 0.503 | 0.2 | 0.1 |
| -0.990000000000085 | 0.505 | 0.201 | 0.1 |
| -0.985000000000085 | 0.508 | 0.201 | 0.1 |
| -0.980000000000085 | 0.51 | 0.202 | 0.1 |
| -0.975000000000085 | 0.513 | 0.202 | 0.1 |
| -0.970000000000085 | 0.515 | 0.202 | 0.101 |
| -0.965000000000085 | 0.518 | 0.203 | 0.101 |
| -0.960000000000085 | 0.52 | 0.203 | 0.101 |
| -0.955000000000085 | 0.523 | 0.204 | 0.101 |
| -0.950000000000085 | 0.526 | 0.204 | 0.101 |
| -0.945000000000085 | 0.528 | 0.204 | 0.101 |
| -0.940000000000085 | 0.531 | 0.205 | 0.101 |
| -0.935000000000085 | 0.534 | 0.205 | 0.101 |
| -0.930000000000085 | 0.536 | 0.206 | 0.101 |
| -0.925000000000085 | 0.539 | 0.206 | 0.101 |
| -0.920000000000085 | 0.542 | 0.206 | 0.102 |
| -0.915000000000085 | 0.544 | 0.207 | 0.102 |
| -0.910000000000085 | 0.547 | 0.207 | 0.102 |
| -0.905000000000085 | 0.55 | 0.208 | 0.102 |
| -0.900000000000085 | 0.552 | 0.208 | 0.102 |
| -0.895000000000085 | 0.555 | 0.208 | 0.102 |
| -0.890000000000085 | 0.558 | 0.209 | 0.102 |
| -0.885000000000085 | 0.561 | 0.209 | 0.102 |
| -0.880000000000085 | 0.564 | 0.209 | 0.102 |
| -0.875000000000085 | 0.566 | 0.21 | 0.102 |
| -0.870000000000085 | 0.569 | 0.21 | 0.102 |
| -0.865000000000085 | 0.572 | 0.211 | 0.103 |
| -0.860000000000085 | 0.575 | 0.211 | 0.103 |
| -0.855000000000085 | 0.578 | 0.211 | 0.103 |
| -0.850000000000085 | 0.581 | 0.212 | 0.103 |
| -0.845000000000085 | 0.583 | 0.212 | 0.103 |
| -0.840000000000085 | 0.586 | 0.213 | 0.103 |
| -0.835000000000085 | 0.589 | 0.213 | 0.103 |
| -0.830000000000085 | 0.592 | 0.213 | 0.103 |
| -0.825000000000085 | 0.595 | 0.214 | 0.103 |
| -0.820000000000085 | 0.598 | 0.214 | 0.103 |
| -0.815000000000085 | 0.601 | 0.214 | 0.103 |
| -0.810000000000085 | 0.604 | 0.215 | 0.104 |
| -0.805000000000085 | 0.607 | 0.215 | 0.104 |
| -0.800000000000085 | 0.61 | 0.216 | 0.104 |
| -0.795000000000085 | 0.613 | 0.216 | 0.104 |
| -0.790000000000085 | 0.616 | 0.216 | 0.104 |
| -0.785000000000085 | 0.619 | 0.217 | 0.104 |
| -0.780000000000085 | 0.622 | 0.217 | 0.104 |
| -0.775000000000085 | 0.625 | 0.217 | 0.104 |
| -0.770000000000085 | 0.628 | 0.218 | 0.104 |
| -0.765000000000085 | 0.631 | 0.218 | 0.104 |
| -0.760000000000085 | 0.634 | 0.218 | 0.104 |
| -0.755000000000085 | 0.637 | 0.219 | 0.104 |
| -0.750000000000085 | 0.64 | 0.219 | 0.105 |
| -0.745000000000085 | 0.643 | 0.22 | 0.105 |
| -0.740000000000085 | 0.646 | 0.22 | 0.105 |
| -0.735000000000085 | 0.649 | 0.22 | 0.105 |
| -0.730000000000085 | 0.652 | 0.221 | 0.105 |
| -0.725000000000085 | 0.655 | 0.221 | 0.105 |
| -0.720000000000085 | 0.659 | 0.221 | 0.105 |
| -0.715000000000085 | 0.662 | 0.222 | 0.105 |
| -0.710000000000085 | 0.665 | 0.222 | 0.105 |
| -0.705000000000085 | 0.668 | 0.222 | 0.105 |
| -0.700000000000085 | 0.671 | 0.223 | 0.105 |
| -0.695000000000085 | 0.674 | 0.223 | 0.105 |
| -0.690000000000085 | 0.677 | 0.223 | 0.106 |
| -0.685000000000085 | 0.681 | 0.224 | 0.106 |
| -0.680000000000085 | 0.684 | 0.224 | 0.106 |
| -0.675000000000085 | 0.687 | 0.224 | 0.106 |
| -0.670000000000085 | 0.69 | 0.225 | 0.106 |
| -0.665000000000085 | 0.693 | 0.225 | 0.106 |
| -0.660000000000085 | 0.697 | 0.225 | 0.106 |
| -0.655000000000085 | 0.7 | 0.226 | 0.106 |
| -0.650000000000085 | 0.703 | 0.226 | 0.106 |
| -0.645000000000085 | 0.706 | 0.226 | 0.106 |
| -0.640000000000085 | 0.709 | 0.227 | 0.106 |
| -0.635000000000085 | 0.713 | 0.227 | 0.106 |
| -0.630000000000085 | 0.716 | 0.227 | 0.106 |
| -0.625000000000085 | 0.719 | 0.228 | 0.106 |
| -0.620000000000085 | 0.722 | 0.228 | 0.107 |
| -0.615000000000085 | 0.726 | 0.228 | 0.107 |
| -0.610000000000085 | 0.729 | 0.229 | 0.107 |
| -0.605000000000085 | 0.732 | 0.229 | 0.107 |
| -0.600000000000085 | 0.735 | 0.229 | 0.107 |
| -0.595000000000085 | 0.739 | 0.23 | 0.107 |
| -0.590000000000085 | 0.742 | 0.23 | 0.107 |
| -0.585000000000085 | 0.745 | 0.23 | 0.107 |
| -0.580000000000085 | 0.748 | 0.231 | 0.107 |
| -0.575000000000085 | 0.752 | 0.231 | 0.107 |
| -0.570000000000085 | 0.755 | 0.231 | 0.107 |
| -0.565000000000085 | 0.758 | 0.232 | 0.107 |
| -0.560000000000085 | 0.761 | 0.232 | 0.107 |
| -0.555000000000085 | 0.765 | 0.232 | 0.107 |
| -0.550000000000085 | 0.768 | 0.232 | 0.107 |
| -0.545000000000085 | 0.771 | 0.233 | 0.108 |
| -0.540000000000085 | 0.774 | 0.233 | 0.108 |
| -0.535000000000085 | 0.777 | 0.233 | 0.108 |
| -0.530000000000085 | 0.781 | 0.234 | 0.108 |
| -0.525000000000085 | 0.784 | 0.234 | 0.108 |
| -0.520000000000085 | 0.787 | 0.234 | 0.108 |
| -0.515000000000085 | 0.79 | 0.234 | 0.108 |
| -0.510000000000085 | 0.794 | 0.235 | 0.108 |
| -0.505000000000085 | 0.797 | 0.235 | 0.108 |
| -0.500000000000085 | 0.8 | 0.235 | 0.108 |
| -0.495000000000085 | 0.803 | 0.236 | 0.108 |
| -0.490000000000085 | 0.806 | 0.236 | 0.108 |
| -0.485000000000085 | 0.81 | 0.236 | 0.108 |
| -0.480000000000085 | 0.813 | 0.236 | 0.108 |
| -0.475000000000085 | 0.816 | 0.237 | 0.108 |
| -0.470000000000085 | 0.819 | 0.237 | 0.108 |
| -0.465000000000085 | 0.822 | 0.237 | 0.109 |
| -0.460000000000085 | 0.825 | 0.237 | 0.109 |
| -0.455000000000085 | 0.828 | 0.238 | 0.109 |
| -0.450000000000085 | 0.832 | 0.238 | 0.109 |
| -0.445000000000085 | 0.835 | 0.238 | 0.109 |
| -0.440000000000085 | 0.838 | 0.238 | 0.109 |
| -0.435000000000085 | 0.841 | 0.239 | 0.109 |
| -0.430000000000085 | 0.844 | 0.239 | 0.109 |
| -0.425000000000085 | 0.847 | 0.239 | 0.109 |
| -0.420000000000085 | 0.85 | 0.239 | 0.109 |
| -0.415000000000085 | 0.853 | 0.24 | 0.109 |
| -0.410000000000085 | 0.856 | 0.24 | 0.109 |
| -0.405000000000085 | 0.859 | 0.24 | 0.109 |
| -0.400000000000085 | 0.862 | 0.24 | 0.109 |
| -0.395000000000085 | 0.865 | 0.241 | 0.109 |
| -0.390000000000085 | 0.868 | 0.241 | 0.109 |
| -0.385000000000085 | 0.871 | 0.241 | 0.109 |
| -0.380000000000085 | 0.874 | 0.241 | 0.109 |
| -0.375000000000085 | 0.877 | 0.242 | 0.109 |
| -0.370000000000085 | 0.88 | 0.242 | 0.109 |
| -0.365000000000085 | 0.882 | 0.242 | 0.109 |
| -0.360000000000085 | 0.885 | 0.242 | 0.11 |
| -0.355000000000085 | 0.888 | 0.242 | 0.11 |
| -0.350000000000085 | 0.891 | 0.243 | 0.11 |
| -0.345000000000085 | 0.894 | 0.243 | 0.11 |
| -0.340000000000085 | 0.896 | 0.243 | 0.11 |
| -0.335000000000085 | 0.899 | 0.243 | 0.11 |
| -0.330000000000085 | 0.902 | 0.243 | 0.11 |
| -0.325000000000085 | 0.904 | 0.244 | 0.11 |
| -0.320000000000085 | 0.907 | 0.244 | 0.11 |
| -0.315000000000085 | 0.91 | 0.244 | 0.11 |
| -0.310000000000085 | 0.912 | 0.244 | 0.11 |
| -0.305000000000085 | 0.915 | 0.244 | 0.11 |
| -0.300000000000085 | 0.917 | 0.244 | 0.11 |
| -0.295000000000085 | 0.92 | 0.245 | 0.11 |
| -0.290000000000085 | 0.922 | 0.245 | 0.11 |
| -0.285000000000085 | 0.925 | 0.245 | 0.11 |
| -0.280000000000085 | 0.927 | 0.245 | 0.11 |
| -0.275000000000085 | 0.93 | 0.245 | 0.11 |
| -0.270000000000085 | 0.932 | 0.246 | 0.11 |
| -0.265000000000085 | 0.934 | 0.246 | 0.11 |
| -0.260000000000085 | 0.937 | 0.246 | 0.11 |
| -0.255000000000085 | 0.939 | 0.246 | 0.11 |
| -0.250000000000085 | 0.941 | 0.246 | 0.11 |
| -0.245000000000085 | 0.943 | 0.246 | 0.11 |
| -0.240000000000085 | 0.946 | 0.246 | 0.11 |
| -0.235000000000085 | 0.948 | 0.247 | 0.11 |
| -0.230000000000085 | 0.95 | 0.247 | 0.11 |
| -0.225000000000085 | 0.952 | 0.247 | 0.11 |
| -0.220000000000085 | 0.954 | 0.247 | 0.111 |
| -0.215000000000085 | 0.956 | 0.247 | 0.111 |
| -0.210000000000085 | 0.958 | 0.247 | 0.111 |
| -0.205000000000085 | 0.96 | 0.247 | 0.111 |
| -0.200000000000085 | 0.962 | 0.248 | 0.111 |
| -0.195000000000085 | 0.963 | 0.248 | 0.111 |
| -0.190000000000085 | 0.965 | 0.248 | 0.111 |
| -0.185000000000085 | 0.967 | 0.248 | 0.111 |
| -0.180000000000085 | 0.969 | 0.248 | 0.111 |
| -0.175000000000085 | 0.97 | 0.248 | 0.111 |
| -0.170000000000085 | 0.972 | 0.248 | 0.111 |
| -0.165000000000085 | 0.973 | 0.248 | 0.111 |
| -0.160000000000085 | 0.975 | 0.248 | 0.111 |
| -0.155000000000084 | 0.977 | 0.249 | 0.111 |
| -0.150000000000084 | 0.978 | 0.249 | 0.111 |
| -0.145000000000084 | 0.979 | 0.249 | 0.111 |
| -0.140000000000084 | 0.981 | 0.249 | 0.111 |
| -0.135000000000084 | 0.982 | 0.249 | 0.111 |
| -0.130000000000084 | 0.983 | 0.249 | 0.111 |
| -0.125000000000084 | 0.985 | 0.249 | 0.111 |
| -0.120000000000084 | 0.986 | 0.249 | 0.111 |
| -0.115000000000084 | 0.987 | 0.249 | 0.111 |
| -0.110000000000084 | 0.988 | 0.249 | 0.111 |
| -0.105000000000084 | 0.989 | 0.249 | 0.111 |
| -0.100000000000084 | 0.99 | 0.249 | 0.111 |
| -0.0950000000000844 | 0.991 | 0.249 | 0.111 |
| -0.0900000000000844 | 0.992 | 0.249 | 0.111 |
| -0.0850000000000844 | 0.993 | 0.25 | 0.111 |
| -0.0800000000000844 | 0.994 | 0.25 | 0.111 |
| -0.0750000000000844 | 0.994 | 0.25 | 0.111 |
| -0.0700000000000844 | 0.995 | 0.25 | 0.111 |
| -0.0650000000000844 | 0.996 | 0.25 | 0.111 |
| -0.0600000000000844 | 0.996 | 0.25 | 0.111 |
| -0.0550000000000844 | 0.997 | 0.25 | 0.111 |
| -0.0500000000000844 | 0.998 | 0.25 | 0.111 |
| -0.0450000000000844 | 0.998 | 0.25 | 0.111 |
| -0.0400000000000844 | 0.998 | 0.25 | 0.111 |
| -0.0350000000000844 | 0.999 | 0.25 | 0.111 |
| -0.0300000000000844 | 0.999 | 0.25 | 0.111 |
| -0.0250000000000844 | 0.999 | 0.25 | 0.111 |
| -0.0200000000000844 | 1 | 0.25 | 0.111 |
| -0.0150000000000844 | 1 | 0.25 | 0.111 |
| -0.0100000000000844 | 1 | 0.25 | 0.111 |
| -0.00500000000008444 | 1 | 0.25 | 0.111 |
| -8.4444604087075e-14 | 1 | 0.25 | 0.111 |
| 0.00499999999991555 | 1 | 0.25 | 0.111 |
| 0.00999999999991555 | 1 | 0.25 | 0.111 |
| 0.0149999999999156 | 1 | 0.25 | 0.111 |
| 0.0199999999999156 | 1 | 0.25 | 0.111 |
| 0.0249999999999156 | 0.999 | 0.25 | 0.111 |
| 0.0299999999999156 | 0.999 | 0.25 | 0.111 |
| 0.0349999999999155 | 0.999 | 0.25 | 0.111 |
| 0.0399999999999155 | 0.998 | 0.25 | 0.111 |
| 0.0449999999999155 | 0.998 | 0.25 | 0.111 |
| 0.0499999999999155 | 0.998 | 0.25 | 0.111 |
| 0.0549999999999155 | 0.997 | 0.25 | 0.111 |
| 0.0599999999999155 | 0.996 | 0.25 | 0.111 |
| 0.0649999999999155 | 0.996 | 0.25 | 0.111 |
| 0.0699999999999155 | 0.995 | 0.25 | 0.111 |
| 0.0749999999999155 | 0.994 | 0.25 | 0.111 |
| 0.0799999999999155 | 0.994 | 0.25 | 0.111 |
| 0.0849999999999155 | 0.993 | 0.25 | 0.111 |
| 0.0899999999999155 | 0.992 | 0.249 | 0.111 |
| 0.0949999999999155 | 0.991 | 0.249 | 0.111 |
| 0.0999999999999155 | 0.99 | 0.249 | 0.111 |
| 0.104999999999916 | 0.989 | 0.249 | 0.111 |
| 0.109999999999916 | 0.988 | 0.249 | 0.111 |
| 0.114999999999916 | 0.987 | 0.249 | 0.111 |
| 0.119999999999916 | 0.986 | 0.249 | 0.111 |
| 0.124999999999916 | 0.985 | 0.249 | 0.111 |
| 0.129999999999916 | 0.983 | 0.249 | 0.111 |
| 0.134999999999916 | 0.982 | 0.249 | 0.111 |
| 0.139999999999916 | 0.981 | 0.249 | 0.111 |
| 0.144999999999916 | 0.979 | 0.249 | 0.111 |
| 0.149999999999916 | 0.978 | 0.249 | 0.111 |
| 0.154999999999916 | 0.977 | 0.249 | 0.111 |
| 0.159999999999916 | 0.975 | 0.248 | 0.111 |
| 0.164999999999916 | 0.973 | 0.248 | 0.111 |
| 0.169999999999916 | 0.972 | 0.248 | 0.111 |
| 0.174999999999916 | 0.97 | 0.248 | 0.111 |
| 0.179999999999916 | 0.969 | 0.248 | 0.111 |
| 0.184999999999916 | 0.967 | 0.248 | 0.111 |
| 0.189999999999916 | 0.965 | 0.248 | 0.111 |
| 0.194999999999916 | 0.963 | 0.248 | 0.111 |
| 0.199999999999916 | 0.962 | 0.248 | 0.111 |
| 0.204999999999916 | 0.96 | 0.247 | 0.111 |
| 0.209999999999916 | 0.958 | 0.247 | 0.111 |
| 0.214999999999916 | 0.956 | 0.247 | 0.111 |
| 0.219999999999916 | 0.954 | 0.247 | 0.111 |
| 0.224999999999916 | 0.952 | 0.247 | 0.11 |
| 0.229999999999916 | 0.95 | 0.247 | 0.11 |
| 0.234999999999916 | 0.948 | 0.247 | 0.11 |
| 0.239999999999916 | 0.946 | 0.246 | 0.11 |
| 0.244999999999916 | 0.943 | 0.246 | 0.11 |
| 0.249999999999916 | 0.941 | 0.246 | 0.11 |
| 0.254999999999916 | 0.939 | 0.246 | 0.11 |
| 0.259999999999916 | 0.937 | 0.246 | 0.11 |
| 0.264999999999916 | 0.934 | 0.246 | 0.11 |
| 0.269999999999916 | 0.932 | 0.246 | 0.11 |
| 0.274999999999916 | 0.93 | 0.245 | 0.11 |
| 0.279999999999916 | 0.927 | 0.245 | 0.11 |
| 0.284999999999916 | 0.925 | 0.245 | 0.11 |
| 0.289999999999916 | 0.922 | 0.245 | 0.11 |
| 0.294999999999916 | 0.92 | 0.245 | 0.11 |
| 0.299999999999916 | 0.917 | 0.244 | 0.11 |
| 0.304999999999916 | 0.915 | 0.244 | 0.11 |
| 0.309999999999916 | 0.912 | 0.244 | 0.11 |
| 0.314999999999916 | 0.91 | 0.244 | 0.11 |
| 0.319999999999916 | 0.907 | 0.244 | 0.11 |
| 0.324999999999916 | 0.904 | 0.244 | 0.11 |
| 0.329999999999916 | 0.902 | 0.243 | 0.11 |
| 0.334999999999916 | 0.899 | 0.243 | 0.11 |
| 0.339999999999916 | 0.896 | 0.243 | 0.11 |
| 0.344999999999916 | 0.894 | 0.243 | 0.11 |
| 0.349999999999916 | 0.891 | 0.243 | 0.11 |
| 0.354999999999916 | 0.888 | 0.242 | 0.11 |
| 0.359999999999916 | 0.885 | 0.242 | 0.11 |
| 0.364999999999916 | 0.882 | 0.242 | 0.109 |
| 0.369999999999916 | 0.88 | 0.242 | 0.109 |
| 0.374999999999916 | 0.877 | 0.242 | 0.109 |
| 0.379999999999916 | 0.874 | 0.241 | 0.109 |
| 0.384999999999916 | 0.871 | 0.241 | 0.109 |
| 0.389999999999916 | 0.868 | 0.241 | 0.109 |
| 0.394999999999916 | 0.865 | 0.241 | 0.109 |
| 0.399999999999916 | 0.862 | 0.24 | 0.109 |
| 0.404999999999916 | 0.859 | 0.24 | 0.109 |
| 0.409999999999916 | 0.856 | 0.24 | 0.109 |
| 0.414999999999916 | 0.853 | 0.24 | 0.109 |
| 0.419999999999916 | 0.85 | 0.239 | 0.109 |
| 0.424999999999916 | 0.847 | 0.239 | 0.109 |
| 0.429999999999916 | 0.844 | 0.239 | 0.109 |
| 0.434999999999916 | 0.841 | 0.239 | 0.109 |
| 0.439999999999916 | 0.838 | 0.238 | 0.109 |
| 0.444999999999916 | 0.835 | 0.238 | 0.109 |
| 0.449999999999916 | 0.832 | 0.238 | 0.109 |
| 0.454999999999916 | 0.828 | 0.238 | 0.109 |
| 0.459999999999916 | 0.825 | 0.237 | 0.109 |
| 0.464999999999916 | 0.822 | 0.237 | 0.109 |
| 0.469999999999916 | 0.819 | 0.237 | 0.108 |
| 0.474999999999916 | 0.816 | 0.237 | 0.108 |
| 0.479999999999916 | 0.813 | 0.236 | 0.108 |
| 0.484999999999916 | 0.81 | 0.236 | 0.108 |
| 0.489999999999916 | 0.806 | 0.236 | 0.108 |
| 0.494999999999916 | 0.803 | 0.236 | 0.108 |
| 0.499999999999916 | 0.8 | 0.235 | 0.108 |
| 0.504999999999916 | 0.797 | 0.235 | 0.108 |
| 0.509999999999916 | 0.794 | 0.235 | 0.108 |
| 0.514999999999916 | 0.79 | 0.234 | 0.108 |
| 0.519999999999916 | 0.787 | 0.234 | 0.108 |
| 0.524999999999916 | 0.784 | 0.234 | 0.108 |
| 0.529999999999916 | 0.781 | 0.234 | 0.108 |
| 0.534999999999916 | 0.777 | 0.233 | 0.108 |
| 0.539999999999916 | 0.774 | 0.233 | 0.108 |
| 0.544999999999916 | 0.771 | 0.233 | 0.108 |
| 0.549999999999916 | 0.768 | 0.232 | 0.107 |
| 0.554999999999916 | 0.765 | 0.232 | 0.107 |
| 0.559999999999916 | 0.761 | 0.232 | 0.107 |
| 0.564999999999916 | 0.758 | 0.232 | 0.107 |
| 0.569999999999916 | 0.755 | 0.231 | 0.107 |
| 0.574999999999916 | 0.752 | 0.231 | 0.107 |
| 0.579999999999916 | 0.748 | 0.231 | 0.107 |
| 0.584999999999916 | 0.745 | 0.23 | 0.107 |
| 0.589999999999916 | 0.742 | 0.23 | 0.107 |
| 0.594999999999916 | 0.739 | 0.23 | 0.107 |
| 0.599999999999916 | 0.735 | 0.229 | 0.107 |
| 0.604999999999916 | 0.732 | 0.229 | 0.107 |
| 0.609999999999916 | 0.729 | 0.229 | 0.107 |
| 0.614999999999916 | 0.726 | 0.228 | 0.107 |
| 0.619999999999916 | 0.722 | 0.228 | 0.107 |
| 0.624999999999916 | 0.719 | 0.228 | 0.106 |
| 0.629999999999916 | 0.716 | 0.227 | 0.106 |
| 0.634999999999916 | 0.713 | 0.227 | 0.106 |
| 0.639999999999916 | 0.709 | 0.227 | 0.106 |
| 0.644999999999916 | 0.706 | 0.226 | 0.106 |
| 0.649999999999916 | 0.703 | 0.226 | 0.106 |
| 0.654999999999916 | 0.7 | 0.226 | 0.106 |
| 0.659999999999916 | 0.697 | 0.225 | 0.106 |
| 0.664999999999916 | 0.693 | 0.225 | 0.106 |
| 0.669999999999916 | 0.69 | 0.225 | 0.106 |
| 0.674999999999916 | 0.687 | 0.224 | 0.106 |
| 0.679999999999916 | 0.684 | 0.224 | 0.106 |
| 0.684999999999916 | 0.681 | 0.224 | 0.106 |
| 0.689999999999916 | 0.677 | 0.223 | 0.106 |
| 0.694999999999916 | 0.674 | 0.223 | 0.105 |
| 0.699999999999916 | 0.671 | 0.223 | 0.105 |
| 0.704999999999916 | 0.668 | 0.222 | 0.105 |
| 0.709999999999916 | 0.665 | 0.222 | 0.105 |
| 0.714999999999916 | 0.662 | 0.222 | 0.105 |
| 0.719999999999916 | 0.659 | 0.221 | 0.105 |
| 0.724999999999916 | 0.655 | 0.221 | 0.105 |
| 0.729999999999916 | 0.652 | 0.221 | 0.105 |
| 0.734999999999916 | 0.649 | 0.22 | 0.105 |
| 0.739999999999916 | 0.646 | 0.22 | 0.105 |
| 0.744999999999916 | 0.643 | 0.22 | 0.105 |
| 0.749999999999916 | 0.64 | 0.219 | 0.105 |
| 0.754999999999916 | 0.637 | 0.219 | 0.104 |
| 0.759999999999916 | 0.634 | 0.218 | 0.104 |
| 0.764999999999916 | 0.631 | 0.218 | 0.104 |
| 0.769999999999916 | 0.628 | 0.218 | 0.104 |
| 0.774999999999916 | 0.625 | 0.217 | 0.104 |
| 0.779999999999916 | 0.622 | 0.217 | 0.104 |
| 0.784999999999916 | 0.619 | 0.217 | 0.104 |
| 0.789999999999916 | 0.616 | 0.216 | 0.104 |
| 0.794999999999916 | 0.613 | 0.216 | 0.104 |
| 0.799999999999916 | 0.61 | 0.216 | 0.104 |
| 0.804999999999916 | 0.607 | 0.215 | 0.104 |
| 0.809999999999916 | 0.604 | 0.215 | 0.104 |
| 0.814999999999916 | 0.601 | 0.214 | 0.103 |
| 0.819999999999916 | 0.598 | 0.214 | 0.103 |
| 0.824999999999916 | 0.595 | 0.214 | 0.103 |
| 0.829999999999916 | 0.592 | 0.213 | 0.103 |
| 0.834999999999916 | 0.589 | 0.213 | 0.103 |
| 0.839999999999916 | 0.586 | 0.213 | 0.103 |
| 0.844999999999916 | 0.583 | 0.212 | 0.103 |
| 0.849999999999916 | 0.581 | 0.212 | 0.103 |
| 0.854999999999916 | 0.578 | 0.211 | 0.103 |
| 0.859999999999916 | 0.575 | 0.211 | 0.103 |
| 0.864999999999916 | 0.572 | 0.211 | 0.103 |
| 0.869999999999916 | 0.569 | 0.21 | 0.102 |
| 0.874999999999916 | 0.566 | 0.21 | 0.102 |
| 0.879999999999916 | 0.564 | 0.209 | 0.102 |
| 0.884999999999916 | 0.561 | 0.209 | 0.102 |
| 0.889999999999916 | 0.558 | 0.209 | 0.102 |
| 0.894999999999916 | 0.555 | 0.208 | 0.102 |
| 0.899999999999916 | 0.552 | 0.208 | 0.102 |
| 0.904999999999916 | 0.55 | 0.208 | 0.102 |
| 0.909999999999916 | 0.547 | 0.207 | 0.102 |
| 0.914999999999916 | 0.544 | 0.207 | 0.102 |
| 0.919999999999916 | 0.542 | 0.206 | 0.102 |
| 0.924999999999916 | 0.539 | 0.206 | 0.101 |
| 0.929999999999916 | 0.536 | 0.206 | 0.101 |
| 0.934999999999916 | 0.534 | 0.205 | 0.101 |
| 0.939999999999916 | 0.531 | 0.205 | 0.101 |
| 0.944999999999916 | 0.528 | 0.204 | 0.101 |
| 0.949999999999916 | 0.526 | 0.204 | 0.101 |
| 0.954999999999916 | 0.523 | 0.204 | 0.101 |
| 0.959999999999916 | 0.52 | 0.203 | 0.101 |
| 0.964999999999916 | 0.518 | 0.203 | 0.101 |
| 0.969999999999916 | 0.515 | 0.202 | 0.101 |
| 0.974999999999916 | 0.513 | 0.202 | 0.1 |
| 0.979999999999916 | 0.51 | 0.202 | 0.1 |
| 0.984999999999916 | 0.508 | 0.201 | 0.1 |
| 0.989999999999916 | 0.505 | 0.201 | 0.1 |
| 0.994999999999916 | 0.503 | 0.2 | 0.1 |
| 0.999999999999916 | 0.5 | 0.2 | 0.1 |
| 1.004999999999916 | 0.498 | 0.2 | 0.1 |
| 1.009999999999916 | 0.495 | 0.199 | 0.1 |
| 1.014999999999916 | 0.493 | 0.199 | 0.1 |
| 1.019999999999916 | 0.49 | 0.198 | 0.1 |
| 1.024999999999916 | 0.488 | 0.198 | 0.099 |
| 1.029999999999916 | 0.485 | 0.198 | 0.099 |
| 1.034999999999916 | 0.483 | 0.197 | 0.099 |
| 1.039999999999915 | 0.48 | 0.197 | 0.099 |
| 1.044999999999915 | 0.478 | 0.196 | 0.099 |
| 1.049999999999915 | 0.476 | 0.196 | 0.099 |
| 1.054999999999915 | 0.473 | 0.196 | 0.099 |
| 1.059999999999915 | 0.471 | 0.195 | 0.099 |
| 1.064999999999915 | 0.469 | 0.195 | 0.099 |
| 1.069999999999915 | 0.466 | 0.194 | 0.099 |
| 1.074999999999915 | 0.464 | 0.194 | 0.098 |
| 1.079999999999915 | 0.462 | 0.194 | 0.098 |
| 1.084999999999914 | 0.459 | 0.193 | 0.098 |
| 1.089999999999914 | 0.457 | 0.193 | 0.098 |
| 1.094999999999914 | 0.455 | 0.192 | 0.098 |
| 1.099999999999914 | 0.452 | 0.192 | 0.098 |
| 1.104999999999914 | 0.45 | 0.192 | 0.098 |
| 1.109999999999914 | 0.448 | 0.191 | 0.098 |
| 1.114999999999914 | 0.446 | 0.191 | 0.098 |
| 1.119999999999914 | 0.444 | 0.19 | 0.098 |
| 1.124999999999914 | 0.441 | 0.19 | 0.097 |
| 1.129999999999914 | 0.439 | 0.19 | 0.097 |
| 1.134999999999913 | 0.437 | 0.189 | 0.097 |
| 1.139999999999913 | 0.435 | 0.189 | 0.097 |
| 1.144999999999913 | 0.433 | 0.188 | 0.097 |
| 1.149999999999913 | 0.431 | 0.188 | 0.097 |
| 1.154999999999913 | 0.428 | 0.187 | 0.097 |
| 1.159999999999913 | 0.426 | 0.187 | 0.097 |
| 1.164999999999913 | 0.424 | 0.187 | 0.097 |
| 1.169999999999913 | 0.422 | 0.186 | 0.096 |
| 1.174999999999913 | 0.42 | 0.186 | 0.096 |
| 1.179999999999912 | 0.418 | 0.185 | 0.096 |
| 1.184999999999912 | 0.416 | 0.185 | 0.096 |
| 1.189999999999912 | 0.414 | 0.185 | 0.096 |
| 1.194999999999912 | 0.412 | 0.184 | 0.096 |
| 1.199999999999912 | 0.41 | 0.184 | 0.096 |
| 1.204999999999912 | 0.408 | 0.183 | 0.096 |
| 1.209999999999912 | 0.406 | 0.183 | 0.096 |
| 1.214999999999912 | 0.404 | 0.183 | 0.095 |
| 1.219999999999912 | 0.402 | 0.182 | 0.095 |
| 1.224999999999911 | 0.4 | 0.182 | 0.095 |
| 1.229999999999911 | 0.398 | 0.181 | 0.095 |
| 1.234999999999911 | 0.396 | 0.181 | 0.095 |
| 1.239999999999911 | 0.394 | 0.181 | 0.095 |
| 1.244999999999911 | 0.392 | 0.18 | 0.095 |
| 1.249999999999911 | 0.39 | 0.18 | 0.095 |
| 1.254999999999911 | 0.388 | 0.179 | 0.095 |
| 1.259999999999911 | 0.386 | 0.179 | 0.094 |
| 1.264999999999911 | 0.385 | 0.179 | 0.094 |
| 1.269999999999911 | 0.383 | 0.178 | 0.094 |
| 1.27499999999991 | 0.381 | 0.178 | 0.094 |
| 1.27999999999991 | 0.379 | 0.177 | 0.094 |
| 1.28499999999991 | 0.377 | 0.177 | 0.094 |
| 1.28999999999991 | 0.375 | 0.177 | 0.094 |
| 1.29499999999991 | 0.374 | 0.176 | 0.094 |
| 1.29999999999991 | 0.372 | 0.176 | 0.094 |
| 1.30499999999991 | 0.37 | 0.175 | 0.093 |
| 1.30999999999991 | 0.368 | 0.175 | 0.093 |
| 1.31499999999991 | 0.366 | 0.175 | 0.093 |
| 1.319999999999909 | 0.365 | 0.174 | 0.093 |
| 1.324999999999909 | 0.363 | 0.174 | 0.093 |
| 1.329999999999909 | 0.361 | 0.173 | 0.093 |
| 1.334999999999909 | 0.359 | 0.173 | 0.093 |
| 1.339999999999909 | 0.358 | 0.173 | 0.093 |
| 1.344999999999909 | 0.356 | 0.172 | 0.093 |
| 1.349999999999909 | 0.354 | 0.172 | 0.092 |
| 1.354999999999909 | 0.353 | 0.171 | 0.092 |
| 1.359999999999909 | 0.351 | 0.171 | 0.092 |
| 1.364999999999908 | 0.349 | 0.171 | 0.092 |
| 1.369999999999908 | 0.348 | 0.17 | 0.092 |
| 1.374999999999908 | 0.346 | 0.17 | 0.092 |
| 1.379999999999908 | 0.344 | 0.169 | 0.092 |
| 1.384999999999908 | 0.343 | 0.169 | 0.092 |
| 1.389999999999908 | 0.341 | 0.169 | 0.091 |
| 1.394999999999908 | 0.339 | 0.168 | 0.091 |
| 1.399999999999908 | 0.338 | 0.168 | 0.091 |
| 1.404999999999908 | 0.336 | 0.167 | 0.091 |
| 1.409999999999908 | 0.335 | 0.167 | 0.091 |
| 1.414999999999907 | 0.333 | 0.167 | 0.091 |
| 1.419999999999907 | 0.332 | 0.166 | 0.091 |
| 1.424999999999907 | 0.33 | 0.166 | 0.091 |
| 1.429999999999907 | 0.328 | 0.165 | 0.091 |
| 1.434999999999907 | 0.327 | 0.165 | 0.09 |
| 1.439999999999907 | 0.325 | 0.165 | 0.09 |
| 1.444999999999907 | 0.324 | 0.164 | 0.09 |
| 1.449999999999907 | 0.322 | 0.164 | 0.09 |
| 1.454999999999907 | 0.321 | 0.163 | 0.09 |
| 1.459999999999906 | 0.319 | 0.163 | 0.09 |
| 1.464999999999906 | 0.318 | 0.163 | 0.09 |
| 1.469999999999906 | 0.316 | 0.162 | 0.09 |
| 1.474999999999906 | 0.315 | 0.162 | 0.089 |
| 1.479999999999906 | 0.313 | 0.162 | 0.089 |
| 1.484999999999906 | 0.312 | 0.161 | 0.089 |
| 1.489999999999906 | 0.311 | 0.161 | 0.089 |
| 1.494999999999906 | 0.309 | 0.16 | 0.089 |
| 1.499999999999906 | 0.308 | 0.16 | 0.089 |
| 1.504999999999906 | 0.306 | 0.16 | 0.089 |
| 1.509999999999905 | 0.305 | 0.159 | 0.089 |
| 1.514999999999905 | 0.303 | 0.159 | 0.089 |
| 1.519999999999905 | 0.302 | 0.158 | 0.088 |
| 1.524999999999905 | 0.301 | 0.158 | 0.088 |
| 1.529999999999905 | 0.299 | 0.158 | 0.088 |
| 1.534999999999905 | 0.298 | 0.157 | 0.088 |
| 1.539999999999905 | 0.297 | 0.157 | 0.088 |
| 1.544999999999905 | 0.295 | 0.157 | 0.088 |
| 1.549999999999905 | 0.294 | 0.156 | 0.088 |
| 1.554999999999904 | 0.293 | 0.156 | 0.088 |
| 1.559999999999904 | 0.291 | 0.155 | 0.087 |
| 1.564999999999904 | 0.29 | 0.155 | 0.087 |
| 1.569999999999904 | 0.289 | 0.155 | 0.087 |
| 1.574999999999904 | 0.287 | 0.154 | 0.087 |
| 1.579999999999904 | 0.286 | 0.154 | 0.087 |
| 1.584999999999904 | 0.285 | 0.154 | 0.087 |
| 1.589999999999904 | 0.283 | 0.153 | 0.087 |
| 1.594999999999904 | 0.282 | 0.153 | 0.087 |
| 1.599999999999903 | 0.281 | 0.152 | 0.087 |
| 1.604999999999903 | 0.28 | 0.152 | 0.086 |
| 1.609999999999903 | 0.278 | 0.152 | 0.086 |
| 1.614999999999903 | 0.277 | 0.151 | 0.086 |
| 1.619999999999903 | 0.276 | 0.151 | 0.086 |
| 1.624999999999903 | 0.275 | 0.151 | 0.086 |
| 1.629999999999903 | 0.273 | 0.15 | 0.086 |
| 1.634999999999903 | 0.272 | 0.15 | 0.086 |
| 1.639999999999903 | 0.271 | 0.149 | 0.086 |
| 1.644999999999902 | 0.27 | 0.149 | 0.085 |
| 1.649999999999902 | 0.269 | 0.149 | 0.085 |
| 1.654999999999902 | 0.267 | 0.148 | 0.085 |
| 1.659999999999902 | 0.266 | 0.148 | 0.085 |
| 1.664999999999902 | 0.265 | 0.148 | 0.085 |
| 1.669999999999902 | 0.264 | 0.147 | 0.085 |
| 1.674999999999902 | 0.263 | 0.147 | 0.085 |
| 1.679999999999902 | 0.262 | 0.147 | 0.085 |
| 1.684999999999902 | 0.26 | 0.146 | 0.084 |
| 1.689999999999901 | 0.259 | 0.146 | 0.084 |
| 1.694999999999901 | 0.258 | 0.145 | 0.084 |
| 1.699999999999901 | 0.257 | 0.145 | 0.084 |
| 1.704999999999901 | 0.256 | 0.145 | 0.084 |
| 1.709999999999901 | 0.255 | 0.144 | 0.084 |
| 1.714999999999901 | 0.254 | 0.144 | 0.084 |
| 1.719999999999901 | 0.253 | 0.144 | 0.084 |
| 1.724999999999901 | 0.252 | 0.143 | 0.084 |
| 1.729999999999901 | 0.25 | 0.143 | 0.083 |
| 1.734999999999901 | 0.249 | 0.143 | 0.083 |
| 1.7399999999999 | 0.248 | 0.142 | 0.083 |
| 1.7449999999999 | 0.247 | 0.142 | 0.083 |
| 1.7499999999999 | 0.246 | 0.142 | 0.083 |
| 1.7549999999999 | 0.245 | 0.141 | 0.083 |
| 1.7599999999999 | 0.244 | 0.141 | 0.083 |
| 1.7649999999999 | 0.243 | 0.141 | 0.083 |
| 1.7699999999999 | 0.242 | 0.14 | 0.082 |
| 1.7749999999999 | 0.241 | 0.14 | 0.082 |
| 1.7799999999999 | 0.24 | 0.14 | 0.082 |
| 1.784999999999899 | 0.239 | 0.139 | 0.082 |
| 1.789999999999899 | 0.238 | 0.139 | 0.082 |
| 1.794999999999899 | 0.237 | 0.138 | 0.082 |
| 1.799999999999899 | 0.236 | 0.138 | 0.082 |
| 1.804999999999899 | 0.235 | 0.138 | 0.082 |
| 1.809999999999899 | 0.234 | 0.137 | 0.081 |
| 1.814999999999899 | 0.233 | 0.137 | 0.081 |
| 1.819999999999899 | 0.232 | 0.137 | 0.081 |
| 1.824999999999899 | 0.231 | 0.136 | 0.081 |
| 1.829999999999899 | 0.23 | 0.136 | 0.081 |
| 1.834999999999898 | 0.229 | 0.136 | 0.081 |
| 1.839999999999898 | 0.228 | 0.135 | 0.081 |
| 1.844999999999898 | 0.227 | 0.135 | 0.081 |
| 1.849999999999898 | 0.226 | 0.135 | 0.08 |
| 1.854999999999898 | 0.225 | 0.134 | 0.08 |
| 1.859999999999898 | 0.224 | 0.134 | 0.08 |
| 1.864999999999898 | 0.223 | 0.134 | 0.08 |
| 1.869999999999898 | 0.222 | 0.133 | 0.08 |
| 1.874999999999898 | 0.221 | 0.133 | 0.08 |
| 1.879999999999897 | 0.221 | 0.133 | 0.08 |
| 1.884999999999897 | 0.22 | 0.132 | 0.08 |
| 1.889999999999897 | 0.219 | 0.132 | 0.08 |
| 1.894999999999897 | 0.218 | 0.132 | 0.079 |
| 1.899999999999897 | 0.217 | 0.131 | 0.079 |
| 1.904999999999897 | 0.216 | 0.131 | 0.079 |
| 1.909999999999897 | 0.215 | 0.131 | 0.079 |
| 1.914999999999897 | 0.214 | 0.13 | 0.079 |
| 1.919999999999897 | 0.213 | 0.13 | 0.079 |
| 1.924999999999897 | 0.213 | 0.13 | 0.079 |
| 1.929999999999896 | 0.212 | 0.129 | 0.079 |
| 1.934999999999896 | 0.211 | 0.129 | 0.078 |
| 1.939999999999896 | 0.21 | 0.129 | 0.078 |
| 1.944999999999896 | 0.209 | 0.128 | 0.078 |
| 1.949999999999896 | 0.208 | 0.128 | 0.078 |
| 1.954999999999896 | 0.207 | 0.128 | 0.078 |
| 1.959999999999896 | 0.207 | 0.128 | 0.078 |
| 1.964999999999896 | 0.206 | 0.127 | 0.078 |
| 1.969999999999896 | 0.205 | 0.127 | 0.078 |
| 1.974999999999895 | 0.204 | 0.127 | 0.078 |
| 1.979999999999895 | 0.203 | 0.126 | 0.077 |
| 1.984999999999895 | 0.202 | 0.126 | 0.077 |
| 1.989999999999895 | 0.202 | 0.126 | 0.077 |
| 1.994999999999895 | 0.201 | 0.125 | 0.077 |
| 1.999999999999895 | 0.2 | 0.125 | 0.077 |
| 2.004999999999895 | 0.199 | 0.125 | 0.077 |
| 2.009999999999895 | 0.198 | 0.124 | 0.077 |
| 2.014999999999895 | 0.198 | 0.124 | 0.077 |
| 2.019999999999895 | 0.197 | 0.124 | 0.076 |
| 2.024999999999895 | 0.196 | 0.123 | 0.076 |
| 2.029999999999895 | 0.195 | 0.123 | 0.076 |
| 2.034999999999894 | 0.195 | 0.123 | 0.076 |
| 2.039999999999894 | 0.194 | 0.123 | 0.076 |
| 2.044999999999894 | 0.193 | 0.122 | 0.076 |
| 2.049999999999894 | 0.192 | 0.122 | 0.076 |
| 2.054999999999894 | 0.191 | 0.122 | 0.076 |
| 2.059999999999894 | 0.191 | 0.121 | 0.076 |
| 2.064999999999894 | 0.19 | 0.121 | 0.075 |
| 2.069999999999894 | 0.189 | 0.121 | 0.075 |
| 2.074999999999894 | 0.188 | 0.12 | 0.075 |
| 2.079999999999893 | 0.188 | 0.12 | 0.075 |
| 2.084999999999893 | 0.187 | 0.12 | 0.075 |
| 2.089999999999893 | 0.186 | 0.12 | 0.075 |
| 2.094999999999893 | 0.186 | 0.119 | 0.075 |
| 2.099999999999893 | 0.185 | 0.119 | 0.075 |
| 2.104999999999893 | 0.184 | 0.119 | 0.074 |
| 2.109999999999893 | 0.183 | 0.118 | 0.074 |
| 2.114999999999893 | 0.183 | 0.118 | 0.074 |
| 2.119999999999893 | 0.182 | 0.118 | 0.074 |
| 2.124999999999893 | 0.181 | 0.117 | 0.074 |
| 2.129999999999892 | 0.181 | 0.117 | 0.074 |
| 2.134999999999892 | 0.18 | 0.117 | 0.074 |
| 2.139999999999892 | 0.179 | 0.117 | 0.074 |
| 2.144999999999892 | 0.179 | 0.116 | 0.074 |
| 2.149999999999892 | 0.178 | 0.116 | 0.073 |
| 2.154999999999892 | 0.177 | 0.116 | 0.073 |
| 2.159999999999892 | 0.177 | 0.115 | 0.073 |
| 2.164999999999892 | 0.176 | 0.115 | 0.073 |
| 2.169999999999892 | 0.175 | 0.115 | 0.073 |
| 2.174999999999891 | 0.175 | 0.115 | 0.073 |
| 2.179999999999891 | 0.174 | 0.114 | 0.073 |
| 2.184999999999891 | 0.173 | 0.114 | 0.073 |
| 2.189999999999891 | 0.173 | 0.114 | 0.072 |
| 2.194999999999891 | 0.172 | 0.113 | 0.072 |
| 2.199999999999891 | 0.171 | 0.113 | 0.072 |
| 2.204999999999891 | 0.171 | 0.113 | 0.072 |
| 2.209999999999891 | 0.17 | 0.113 | 0.072 |
| 2.214999999999891 | 0.169 | 0.112 | 0.072 |
| 2.21999999999989 | 0.169 | 0.112 | 0.072 |
| 2.22499999999989 | 0.168 | 0.112 | 0.072 |
| 2.22999999999989 | 0.167 | 0.111 | 0.072 |
| 2.23499999999989 | 0.167 | 0.111 | 0.071 |
| 2.23999999999989 | 0.166 | 0.111 | 0.071 |
| 2.24499999999989 | 0.166 | 0.111 | 0.071 |
| 2.24999999999989 | 0.165 | 0.11 | 0.071 |
| 2.25499999999989 | 0.164 | 0.11 | 0.071 |
| 2.25999999999989 | 0.164 | 0.11 | 0.071 |
| 2.26499999999989 | 0.163 | 0.11 | 0.071 |
| 2.269999999999889 | 0.163 | 0.109 | 0.071 |
| 2.274999999999889 | 0.162 | 0.109 | 0.071 |
| 2.279999999999889 | 0.161 | 0.109 | 0.07 |
| 2.284999999999889 | 0.161 | 0.108 | 0.07 |
| 2.289999999999889 | 0.16 | 0.108 | 0.07 |
| 2.294999999999889 | 0.16 | 0.108 | 0.07 |
| 2.299999999999889 | 0.159 | 0.108 | 0.07 |
| 2.304999999999889 | 0.158 | 0.107 | 0.07 |
| 2.309999999999889 | 0.158 | 0.107 | 0.07 |
| 2.314999999999888 | 0.157 | 0.107 | 0.07 |
| 2.319999999999888 | 0.157 | 0.107 | 0.07 |
| 2.324999999999888 | 0.156 | 0.106 | 0.069 |
| 2.329999999999888 | 0.156 | 0.106 | 0.069 |
| 2.334999999999888 | 0.155 | 0.106 | 0.069 |
| 2.339999999999888 | 0.154 | 0.106 | 0.069 |
| 2.344999999999888 | 0.154 | 0.105 | 0.069 |
| 2.349999999999888 | 0.153 | 0.105 | 0.069 |
| 2.354999999999888 | 0.153 | 0.105 | 0.069 |
| 2.359999999999887 | 0.152 | 0.104 | 0.069 |
| 2.364999999999887 | 0.152 | 0.104 | 0.069 |
| 2.369999999999887 | 0.151 | 0.104 | 0.068 |
| 2.374999999999887 | 0.151 | 0.104 | 0.068 |
| 2.379999999999887 | 0.15 | 0.103 | 0.068 |
| 2.384999999999887 | 0.15 | 0.103 | 0.068 |
| 2.389999999999887 | 0.149 | 0.103 | 0.068 |
| 2.394999999999887 | 0.148 | 0.103 | 0.068 |
| 2.399999999999887 | 0.148 | 0.102 | 0.068 |
| 2.404999999999887 | 0.147 | 0.102 | 0.068 |
| 2.409999999999886 | 0.147 | 0.102 | 0.068 |
| 2.414999999999886 | 0.146 | 0.102 | 0.067 |
| 2.419999999999886 | 0.146 | 0.101 | 0.067 |
| 2.424999999999886 | 0.145 | 0.101 | 0.067 |
| 2.429999999999886 | 0.145 | 0.101 | 0.067 |
| 2.434999999999886 | 0.144 | 0.101 | 0.067 |
| 2.439999999999886 | 0.144 | 0.1 | 0.067 |
| 2.444999999999886 | 0.143 | 0.1 | 0.067 |
| 2.449999999999886 | 0.143 | 0.1 | 0.067 |
| 2.454999999999885 | 0.142 | 0.1 | 0.067 |
| 2.459999999999885 | 0.142 | 0.099 | 0.066 |
| 2.464999999999885 | 0.141 | 0.099 | 0.066 |
| 2.469999999999885 | 0.141 | 0.099 | 0.066 |
| 2.474999999999885 | 0.14 | 0.099 | 0.066 |
| 2.479999999999885 | 0.14 | 0.099 | 0.066 |
| 2.484999999999885 | 0.139 | 0.098 | 0.066 |
| 2.489999999999885 | 0.139 | 0.098 | 0.066 |
| 2.494999999999885 | 0.138 | 0.098 | 0.066 |
| 2.499999999999884 | 0.138 | 0.098 | 0.066 |
| 2.504999999999884 | 0.137 | 0.097 | 0.065 |
| 2.509999999999884 | 0.137 | 0.097 | 0.065 |
| 2.514999999999884 | 0.137 | 0.097 | 0.065 |
| 2.519999999999884 | 0.136 | 0.097 | 0.065 |
| 2.524999999999884 | 0.136 | 0.096 | 0.065 |
| 2.529999999999884 | 0.135 | 0.096 | 0.065 |
| 2.534999999999884 | 0.135 | 0.096 | 0.065 |
| 2.539999999999884 | 0.134 | 0.096 | 0.065 |
| 2.544999999999884 | 0.134 | 0.095 | 0.065 |
| 2.549999999999883 | 0.133 | 0.095 | 0.065 |
| 2.554999999999883 | 0.133 | 0.095 | 0.064 |
| 2.559999999999883 | 0.132 | 0.095 | 0.064 |
| 2.564999999999883 | 0.132 | 0.095 | 0.064 |
| 2.569999999999883 | 0.131 | 0.094 | 0.064 |
| 2.574999999999883 | 0.131 | 0.094 | 0.064 |
| 2.579999999999883 | 0.131 | 0.094 | 0.064 |
| 2.584999999999883 | 0.13 | 0.094 | 0.064 |
| 2.589999999999883 | 0.13 | 0.093 | 0.064 |
| 2.594999999999882 | 0.129 | 0.093 | 0.064 |
| 2.599999999999882 | 0.129 | 0.093 | 0.063 |
| 2.604999999999882 | 0.128 | 0.093 | 0.063 |
| 2.609999999999882 | 0.128 | 0.092 | 0.063 |
| 2.614999999999882 | 0.128 | 0.092 | 0.063 |
| 2.619999999999882 | 0.127 | 0.092 | 0.063 |
| 2.624999999999882 | 0.127 | 0.092 | 0.063 |
| 2.629999999999882 | 0.126 | 0.092 | 0.063 |
| 2.634999999999882 | 0.126 | 0.091 | 0.063 |
| 2.639999999999881 | 0.125 | 0.091 | 0.063 |
| 2.644999999999881 | 0.125 | 0.091 | 0.063 |
| 2.649999999999881 | 0.125 | 0.091 | 0.062 |
| 2.654999999999881 | 0.124 | 0.091 | 0.062 |
| 2.659999999999881 | 0.124 | 0.09 | 0.062 |
| 2.664999999999881 | 0.123 | 0.09 | 0.062 |
| 2.669999999999881 | 0.123 | 0.09 | 0.062 |
| 2.674999999999881 | 0.123 | 0.09 | 0.062 |
| 2.679999999999881 | 0.122 | 0.089 | 0.062 |
| 2.68499999999988 | 0.122 | 0.089 | 0.062 |
| 2.68999999999988 | 0.121 | 0.089 | 0.062 |
| 2.69499999999988 | 0.121 | 0.089 | 0.061 |
| 2.69999999999988 | 0.121 | 0.089 | 0.061 |
| 2.70499999999988 | 0.12 | 0.088 | 0.061 |
| 2.70999999999988 | 0.12 | 0.088 | 0.061 |
| 2.71499999999988 | 0.119 | 0.088 | 0.061 |
| 2.71999999999988 | 0.119 | 0.088 | 0.061 |
| 2.72499999999988 | 0.119 | 0.088 | 0.061 |
| 2.72999999999988 | 0.118 | 0.087 | 0.061 |
| 2.734999999999879 | 0.118 | 0.087 | 0.061 |
| 2.739999999999879 | 0.118 | 0.087 | 0.061 |
| 2.744999999999879 | 0.117 | 0.087 | 0.06 |
| 2.749999999999879 | 0.117 | 0.086 | 0.06 |
| 2.754999999999879 | 0.116 | 0.086 | 0.06 |
| 2.759999999999879 | 0.116 | 0.086 | 0.06 |
| 2.764999999999879 | 0.116 | 0.086 | 0.06 |
| 2.769999999999879 | 0.115 | 0.086 | 0.06 |
| 2.774999999999879 | 0.115 | 0.085 | 0.06 |
| 2.779999999999878 | 0.115 | 0.085 | 0.06 |
| 2.784999999999878 | 0.114 | 0.085 | 0.06 |
| 2.789999999999878 | 0.114 | 0.085 | 0.06 |
| 2.794999999999878 | 0.113 | 0.085 | 0.059 |
| 2.799999999999878 | 0.113 | 0.084 | 0.059 |
| 2.804999999999878 | 0.113 | 0.084 | 0.059 |
| 2.809999999999878 | 0.112 | 0.084 | 0.059 |
| 2.814999999999878 | 0.112 | 0.084 | 0.059 |
| 2.819999999999878 | 0.112 | 0.084 | 0.059 |
| 2.824999999999878 | 0.111 | 0.083 | 0.059 |
| 2.829999999999877 | 0.111 | 0.083 | 0.059 |
| 2.834999999999877 | 0.111 | 0.083 | 0.059 |
| 2.839999999999877 | 0.11 | 0.083 | 0.059 |
| 2.844999999999877 | 0.11 | 0.083 | 0.058 |
| 2.849999999999877 | 0.11 | 0.082 | 0.058 |
| 2.854999999999877 | 0.109 | 0.082 | 0.058 |
| 2.859999999999877 | 0.109 | 0.082 | 0.058 |
| 2.864999999999877 | 0.109 | 0.082 | 0.058 |
| 2.869999999999877 | 0.108 | 0.082 | 0.058 |
| 2.874999999999876 | 0.108 | 0.082 | 0.058 |
| 2.879999999999876 | 0.108 | 0.081 | 0.058 |
| 2.884999999999876 | 0.107 | 0.081 | 0.058 |
| 2.889999999999876 | 0.107 | 0.081 | 0.058 |
| 2.894999999999876 | 0.107 | 0.081 | 0.058 |
| 2.899999999999876 | 0.106 | 0.081 | 0.057 |
| 2.904999999999876 | 0.106 | 0.08 | 0.057 |
| 2.909999999999876 | 0.106 | 0.08 | 0.057 |
| 2.914999999999876 | 0.105 | 0.08 | 0.057 |
| 2.919999999999876 | 0.105 | 0.08 | 0.057 |
| 2.924999999999875 | 0.105 | 0.08 | 0.057 |
| 2.929999999999875 | 0.104 | 0.079 | 0.057 |
| 2.934999999999875 | 0.104 | 0.079 | 0.057 |
| 2.939999999999875 | 0.104 | 0.079 | 0.057 |
| 2.944999999999875 | 0.103 | 0.079 | 0.057 |
| 2.949999999999875 | 0.103 | 0.079 | 0.056 |
| 2.954999999999875 | 0.103 | 0.079 | 0.056 |
| 2.959999999999875 | 0.102 | 0.078 | 0.056 |
| 2.964999999999875 | 0.102 | 0.078 | 0.056 |
| 2.969999999999874 | 0.102 | 0.078 | 0.056 |
| 2.974999999999874 | 0.102 | 0.078 | 0.056 |
| 2.979999999999874 | 0.101 | 0.078 | 0.056 |
| 2.984999999999874 | 0.101 | 0.077 | 0.056 |
| 2.989999999999874 | 0.101 | 0.077 | 0.056 |
| 2.994999999999874 | 0.1 | 0.077 | 0.056 |
| 2.999999999999874 | 0.1 | 0.077 | 0.056 |
| 3.004999999999874 | 0.1 | 0.077 | 0.055 |
| 3.009999999999874 | 0.099 | 0.077 | 0.055 |
| 3.014999999999874 | 0.099 | 0.076 | 0.055 |
| 3.019999999999873 | 0.099 | 0.076 | 0.055 |
| 3.024999999999873 | 0.099 | 0.076 | 0.055 |
| 3.029999999999873 | 0.098 | 0.076 | 0.055 |
| 3.034999999999873 | 0.098 | 0.076 | 0.055 |
| 3.039999999999873 | 0.098 | 0.076 | 0.055 |
| 3.044999999999873 | 0.097 | 0.075 | 0.055 |
| 3.049999999999873 | 0.097 | 0.075 | 0.055 |
| 3.054999999999873 | 0.097 | 0.075 | 0.055 |
| 3.059999999999873 | 0.096 | 0.075 | 0.054 |
| 3.064999999999872 | 0.096 | 0.075 | 0.054 |
| 3.069999999999872 | 0.096 | 0.074 | 0.054 |
| 3.074999999999872 | 0.096 | 0.074 | 0.054 |
| 3.079999999999872 | 0.095 | 0.074 | 0.054 |
| 3.084999999999872 | 0.095 | 0.074 | 0.054 |
| 3.089999999999872 | 0.095 | 0.074 | 0.054 |
| 3.094999999999872 | 0.095 | 0.074 | 0.054 |
| 3.099999999999872 | 0.094 | 0.073 | 0.054 |
| 3.104999999999872 | 0.094 | 0.073 | 0.054 |
| 3.109999999999872 | 0.094 | 0.073 | 0.054 |
| 3.114999999999871 | 0.093 | 0.073 | 0.053 |
| 3.119999999999871 | 0.093 | 0.073 | 0.053 |
| 3.124999999999871 | 0.093 | 0.073 | 0.053 |
| 3.129999999999871 | 0.093 | 0.072 | 0.053 |
| 3.134999999999871 | 0.092 | 0.072 | 0.053 |
| 3.139999999999871 | 0.092 | 0.072 | 0.053 |
| 3.144999999999871 | 0.092 | 0.072 | 0.053 |
| 3.149999999999871 | 0.092 | 0.072 | 0.053 |
| 3.154999999999871 | 0.091 | 0.072 | 0.053 |
| 3.15999999999987 | 0.091 | 0.072 | 0.053 |
| 3.16499999999987 | 0.091 | 0.071 | 0.053 |
| 3.16999999999987 | 0.091 | 0.071 | 0.052 |
| 3.17499999999987 | 0.09 | 0.071 | 0.052 |
| 3.17999999999987 | 0.09 | 0.071 | 0.052 |
| 3.18499999999987 | 0.09 | 0.071 | 0.052 |
| 3.18999999999987 | 0.089 | 0.071 | 0.052 |
| 3.19499999999987 | 0.089 | 0.07 | 0.052 |
| 3.19999999999987 | 0.089 | 0.07 | 0.052 |
| 3.204999999999869 | 0.089 | 0.07 | 0.052 |
| 3.209999999999869 | 0.088 | 0.07 | 0.052 |
| 3.214999999999869 | 0.088 | 0.07 | 0.052 |
| 3.219999999999869 | 0.088 | 0.07 | 0.052 |
| 3.224999999999869 | 0.088 | 0.069 | 0.052 |
| 3.229999999999869 | 0.087 | 0.069 | 0.051 |
| 3.234999999999869 | 0.087 | 0.069 | 0.051 |
| 3.239999999999869 | 0.087 | 0.069 | 0.051 |
| 3.244999999999869 | 0.087 | 0.069 | 0.051 |
| 3.249999999999869 | 0.086 | 0.069 | 0.051 |
| 3.254999999999868 | 0.086 | 0.069 | 0.051 |
| 3.259999999999868 | 0.086 | 0.068 | 0.051 |
| 3.264999999999868 | 0.086 | 0.068 | 0.051 |
| 3.269999999999868 | 0.086 | 0.068 | 0.051 |
| 3.274999999999868 | 0.085 | 0.068 | 0.051 |
| 3.279999999999868 | 0.085 | 0.068 | 0.051 |
| 3.284999999999868 | 0.085 | 0.068 | 0.051 |
| 3.289999999999868 | 0.085 | 0.067 | 0.05 |
| 3.294999999999868 | 0.084 | 0.067 | 0.05 |
| 3.299999999999867 | 0.084 | 0.067 | 0.05 |
| 3.304999999999867 | 0.084 | 0.067 | 0.05 |
| 3.309999999999867 | 0.084 | 0.067 | 0.05 |
| 3.314999999999867 | 0.083 | 0.067 | 0.05 |
| 3.319999999999867 | 0.083 | 0.067 | 0.05 |
| 3.324999999999867 | 0.083 | 0.066 | 0.05 |
| 3.329999999999867 | 0.083 | 0.066 | 0.05 |
| 3.334999999999867 | 0.082 | 0.066 | 0.05 |
| 3.339999999999867 | 0.082 | 0.066 | 0.05 |
| 3.344999999999866 | 0.082 | 0.066 | 0.05 |
| 3.349999999999866 | 0.082 | 0.066 | 0.049 |
| 3.354999999999866 | 0.082 | 0.066 | 0.049 |
| 3.359999999999866 | 0.081 | 0.065 | 0.049 |
| 3.364999999999866 | 0.081 | 0.065 | 0.049 |
| 3.369999999999866 | 0.081 | 0.065 | 0.049 |
| 3.374999999999866 | 0.081 | 0.065 | 0.049 |
| 3.379999999999866 | 0.08 | 0.065 | 0.049 |
| 3.384999999999866 | 0.08 | 0.065 | 0.049 |
| 3.389999999999866 | 0.08 | 0.065 | 0.049 |
| 3.394999999999865 | 0.08 | 0.064 | 0.049 |
| 3.399999999999865 | 0.08 | 0.064 | 0.049 |
| 3.404999999999865 | 0.079 | 0.064 | 0.049 |
| 3.409999999999865 | 0.079 | 0.064 | 0.048 |
| 3.414999999999865 | 0.079 | 0.064 | 0.048 |
| 3.419999999999865 | 0.079 | 0.064 | 0.048 |
| 3.424999999999865 | 0.079 | 0.064 | 0.048 |
| 3.429999999999865 | 0.078 | 0.063 | 0.048 |
| 3.434999999999865 | 0.078 | 0.063 | 0.048 |
| 3.439999999999864 | 0.078 | 0.063 | 0.048 |
| 3.444999999999864 | 0.078 | 0.063 | 0.048 |
| 3.449999999999864 | 0.078 | 0.063 | 0.048 |
| 3.454999999999864 | 0.077 | 0.063 | 0.048 |
| 3.459999999999864 | 0.077 | 0.063 | 0.048 |
| 3.464999999999864 | 0.077 | 0.062 | 0.048 |
| 3.469999999999864 | 0.077 | 0.062 | 0.048 |
| 3.474999999999864 | 0.076 | 0.062 | 0.047 |
| 3.479999999999864 | 0.076 | 0.062 | 0.047 |
| 3.484999999999864 | 0.076 | 0.062 | 0.047 |
| 3.489999999999863 | 0.076 | 0.062 | 0.047 |
| 3.494999999999863 | 0.076 | 0.062 | 0.047 |
| 3.499999999999863 | 0.075 | 0.062 | 0.047 |
| 3.504999999999863 | 0.075 | 0.061 | 0.047 |
| 3.509999999999863 | 0.075 | 0.061 | 0.047 |
| 3.514999999999863 | 0.075 | 0.061 | 0.047 |
| 3.519999999999863 | 0.075 | 0.061 | 0.047 |
| 3.524999999999863 | 0.074 | 0.061 | 0.047 |
| 3.529999999999863 | 0.074 | 0.061 | 0.047 |
| 3.534999999999862 | 0.074 | 0.061 | 0.047 |
| 3.539999999999862 | 0.074 | 0.06 | 0.046 |
| 3.544999999999862 | 0.074 | 0.06 | 0.046 |
| 3.549999999999862 | 0.074 | 0.06 | 0.046 |
| 3.554999999999862 | 0.073 | 0.06 | 0.046 |
| 3.559999999999862 | 0.073 | 0.06 | 0.046 |
| 3.564999999999862 | 0.073 | 0.06 | 0.046 |
| 3.569999999999862 | 0.073 | 0.06 | 0.046 |
| 3.574999999999862 | 0.073 | 0.06 | 0.046 |
| 3.579999999999862 | 0.072 | 0.059 | 0.046 |
| 3.584999999999861 | 0.072 | 0.059 | 0.046 |
| 3.589999999999861 | 0.072 | 0.059 | 0.046 |
| 3.594999999999861 | 0.072 | 0.059 | 0.046 |
| 3.599999999999861 | 0.072 | 0.059 | 0.046 |
| 3.604999999999861 | 0.071 | 0.059 | 0.045 |
| 3.609999999999861 | 0.071 | 0.059 | 0.045 |
| 3.614999999999861 | 0.071 | 0.059 | 0.045 |
| 3.619999999999861 | 0.071 | 0.058 | 0.045 |
| 3.62499999999986 | 0.071 | 0.058 | 0.045 |
| 3.62999999999986 | 0.071 | 0.058 | 0.045 |
| 3.63499999999986 | 0.07 | 0.058 | 0.045 |
| 3.63999999999986 | 0.07 | 0.058 | 0.045 |
| 3.64499999999986 | 0.07 | 0.058 | 0.045 |
| 3.64999999999986 | 0.07 | 0.058 | 0.045 |
| 3.65499999999986 | 0.07 | 0.058 | 0.045 |
| 3.65999999999986 | 0.069 | 0.057 | 0.045 |
| 3.66499999999986 | 0.069 | 0.057 | 0.045 |
| 3.669999999999859 | 0.069 | 0.057 | 0.045 |
| 3.674999999999859 | 0.069 | 0.057 | 0.044 |
| 3.679999999999859 | 0.069 | 0.057 | 0.044 |
| 3.684999999999859 | 0.069 | 0.057 | 0.044 |
| 3.689999999999859 | 0.068 | 0.057 | 0.044 |
| 3.694999999999859 | 0.068 | 0.057 | 0.044 |
| 3.699999999999859 | 0.068 | 0.057 | 0.044 |
| 3.704999999999859 | 0.068 | 0.056 | 0.044 |
| 3.709999999999859 | 0.068 | 0.056 | 0.044 |
| 3.714999999999859 | 0.068 | 0.056 | 0.044 |
| 3.719999999999858 | 0.067 | 0.056 | 0.044 |
| 3.724999999999858 | 0.067 | 0.056 | 0.044 |
| 3.729999999999858 | 0.067 | 0.056 | 0.044 |
| 3.734999999999858 | 0.067 | 0.056 | 0.044 |
| 3.739999999999858 | 0.067 | 0.056 | 0.044 |
| 3.744999999999858 | 0.067 | 0.055 | 0.043 |
| 3.749999999999858 | 0.066 | 0.055 | 0.043 |
| 3.754999999999858 | 0.066 | 0.055 | 0.043 |
| 3.759999999999858 | 0.066 | 0.055 | 0.043 |
| 3.764999999999857 | 0.066 | 0.055 | 0.043 |
| 3.769999999999857 | 0.066 | 0.055 | 0.043 |
| 3.774999999999857 | 0.066 | 0.055 | 0.043 |
| 3.779999999999857 | 0.065 | 0.055 | 0.043 |
| 3.784999999999857 | 0.065 | 0.055 | 0.043 |
| 3.789999999999857 | 0.065 | 0.054 | 0.043 |
| 3.794999999999857 | 0.065 | 0.054 | 0.043 |
| 3.799999999999857 | 0.065 | 0.054 | 0.043 |
| 3.804999999999857 | 0.065 | 0.054 | 0.043 |
| 3.809999999999857 | 0.064 | 0.054 | 0.043 |
| 3.814999999999856 | 0.064 | 0.054 | 0.042 |
| 3.819999999999856 | 0.064 | 0.054 | 0.042 |
| 3.824999999999856 | 0.064 | 0.054 | 0.042 |
| 3.829999999999856 | 0.064 | 0.054 | 0.042 |
| 3.834999999999856 | 0.064 | 0.053 | 0.042 |
| 3.839999999999856 | 0.064 | 0.053 | 0.042 |
| 3.844999999999856 | 0.063 | 0.053 | 0.042 |
| 3.849999999999856 | 0.063 | 0.053 | 0.042 |
| 3.854999999999856 | 0.063 | 0.053 | 0.042 |
| 3.859999999999855 | 0.063 | 0.053 | 0.042 |
| 3.864999999999855 | 0.063 | 0.053 | 0.042 |
| 3.869999999999855 | 0.063 | 0.053 | 0.042 |
| 3.874999999999855 | 0.062 | 0.053 | 0.042 |
| 3.879999999999855 | 0.062 | 0.052 | 0.042 |
| 3.884999999999855 | 0.062 | 0.052 | 0.042 |
| 3.889999999999855 | 0.062 | 0.052 | 0.041 |
| 3.894999999999855 | 0.062 | 0.052 | 0.041 |
| 3.899999999999855 | 0.062 | 0.052 | 0.041 |
| 3.904999999999855 | 0.062 | 0.052 | 0.041 |
| 3.909999999999854 | 0.061 | 0.052 | 0.041 |
| 3.914999999999854 | 0.061 | 0.052 | 0.041 |
| 3.919999999999854 | 0.061 | 0.052 | 0.041 |
| 3.924999999999854 | 0.061 | 0.052 | 0.041 |
| 3.929999999999854 | 0.061 | 0.051 | 0.041 |
| 3.934999999999854 | 0.061 | 0.051 | 0.041 |
| 3.939999999999854 | 0.061 | 0.051 | 0.041 |
| 3.944999999999854 | 0.06 | 0.051 | 0.041 |
| 3.949999999999854 | 0.06 | 0.051 | 0.041 |
| 3.954999999999853 | 0.06 | 0.051 | 0.041 |
| 3.959999999999853 | 0.06 | 0.051 | 0.041 |
| 3.964999999999853 | 0.06 | 0.051 | 0.04 |
| 3.969999999999853 | 0.06 | 0.051 | 0.04 |
| 3.974999999999853 | 0.06 | 0.051 | 0.04 |
| 3.979999999999853 | 0.059 | 0.05 | 0.04 |
| 3.984999999999853 | 0.059 | 0.05 | 0.04 |
| 3.989999999999853 | 0.059 | 0.05 | 0.04 |
| 3.994999999999853 | 0.059 | 0.05 | 0.04 |
| 3.999999999999853 | 0.059 | 0.05 | 0.04 |
| 4.004999999999852 | 0.059 | 0.05 | 0.04 |
| 4.009999999999852 | 0.059 | 0.05 | 0.04 |
| 4.014999999999852 | 0.058 | 0.05 | 0.04 |
| 4.019999999999852 | 0.058 | 0.05 | 0.04 |
| 4.024999999999852 | 0.058 | 0.05 | 0.04 |
| 4.029999999999852 | 0.058 | 0.049 | 0.04 |
| 4.034999999999852 | 0.058 | 0.049 | 0.04 |
| 4.039999999999851 | 0.058 | 0.049 | 0.039 |
| 4.044999999999852 | 0.058 | 0.049 | 0.039 |
| 4.049999999999851 | 0.057 | 0.049 | 0.039 |
| 4.054999999999851 | 0.057 | 0.049 | 0.039 |
| 4.059999999999851 | 0.057 | 0.049 | 0.039 |
| 4.064999999999851 | 0.057 | 0.049 | 0.039 |
| 4.069999999999851 | 0.057 | 0.049 | 0.039 |
| 4.074999999999851 | 0.057 | 0.049 | 0.039 |
| 4.07999999999985 | 0.057 | 0.048 | 0.039 |
| 4.084999999999851 | 0.057 | 0.048 | 0.039 |
| 4.08999999999985 | 0.056 | 0.048 | 0.039 |
| 4.094999999999851 | 0.056 | 0.048 | 0.039 |
| 4.09999999999985 | 0.056 | 0.048 | 0.039 |
| 4.10499999999985 | 0.056 | 0.048 | 0.039 |
| 4.10999999999985 | 0.056 | 0.048 | 0.039 |
| 4.11499999999985 | 0.056 | 0.048 | 0.039 |
| 4.11999999999985 | 0.056 | 0.048 | 0.038 |
| 4.12499999999985 | 0.056 | 0.048 | 0.038 |
| 4.12999999999985 | 0.055 | 0.047 | 0.038 |
| 4.13499999999985 | 0.055 | 0.047 | 0.038 |
| 4.13999999999985 | 0.055 | 0.047 | 0.038 |
| 4.144999999999849 | 0.055 | 0.047 | 0.038 |
| 4.14999999999985 | 0.055 | 0.047 | 0.038 |
| 4.154999999999849 | 0.055 | 0.047 | 0.038 |
| 4.15999999999985 | 0.055 | 0.047 | 0.038 |
| 4.164999999999849 | 0.055 | 0.047 | 0.038 |
| 4.169999999999849 | 0.054 | 0.047 | 0.038 |
| 4.174999999999849 | 0.054 | 0.047 | 0.038 |
| 4.179999999999848 | 0.054 | 0.047 | 0.038 |
| 4.184999999999849 | 0.054 | 0.046 | 0.038 |
| 4.189999999999848 | 0.054 | 0.046 | 0.038 |
| 4.194999999999848 | 0.054 | 0.046 | 0.038 |
| 4.199999999999848 | 0.054 | 0.046 | 0.038 |
| 4.204999999999848 | 0.054 | 0.046 | 0.037 |
| 4.209999999999848 | 0.053 | 0.046 | 0.037 |
| 4.214999999999848 | 0.053 | 0.046 | 0.037 |
| 4.219999999999847 | 0.053 | 0.046 | 0.037 |
| 4.224999999999848 | 0.053 | 0.046 | 0.037 |
| 4.229999999999847 | 0.053 | 0.046 | 0.037 |
| 4.234999999999847 | 0.053 | 0.046 | 0.037 |
| 4.239999999999847 | 0.053 | 0.046 | 0.037 |
| 4.244999999999847 | 0.053 | 0.045 | 0.037 |
| 4.249999999999847 | 0.052 | 0.045 | 0.037 |
| 4.254999999999847 | 0.052 | 0.045 | 0.037 |
| 4.259999999999846 | 0.052 | 0.045 | 0.037 |
| 4.264999999999847 | 0.052 | 0.045 | 0.037 |
| 4.269999999999846 | 0.052 | 0.045 | 0.037 |
| 4.274999999999846 | 0.052 | 0.045 | 0.037 |
| 4.279999999999846 | 0.052 | 0.045 | 0.037 |
| 4.284999999999846 | 0.052 | 0.045 | 0.037 |
| 4.289999999999846 | 0.052 | 0.045 | 0.036 |
| 4.294999999999846 | 0.051 | 0.045 | 0.036 |
| 4.299999999999846 | 0.051 | 0.044 | 0.036 |
| 4.304999999999846 | 0.051 | 0.044 | 0.036 |
| 4.309999999999845 | 0.051 | 0.044 | 0.036 |
| 4.314999999999846 | 0.051 | 0.044 | 0.036 |
| 4.319999999999845 | 0.051 | 0.044 | 0.036 |
| 4.324999999999846 | 0.051 | 0.044 | 0.036 |
| 4.329999999999845 | 0.051 | 0.044 | 0.036 |
| 4.334999999999845 | 0.051 | 0.044 | 0.036 |
| 4.339999999999845 | 0.05 | 0.044 | 0.036 |
| 4.344999999999845 | 0.05 | 0.044 | 0.036 |
| 4.349999999999845 | 0.05 | 0.044 | 0.036 |
| 4.354999999999845 | 0.05 | 0.044 | 0.036 |
| 4.359999999999844 | 0.05 | 0.043 | 0.036 |
| 4.364999999999845 | 0.05 | 0.043 | 0.036 |
| 4.369999999999844 | 0.05 | 0.043 | 0.036 |
| 4.374999999999844 | 0.05 | 0.043 | 0.036 |
| 4.379999999999844 | 0.05 | 0.043 | 0.035 |
| 4.384999999999844 | 0.049 | 0.043 | 0.035 |
| 4.389999999999844 | 0.049 | 0.043 | 0.035 |
| 4.394999999999844 | 0.049 | 0.043 | 0.035 |
| 4.399999999999844 | 0.049 | 0.043 | 0.035 |
| 4.404999999999844 | 0.049 | 0.043 | 0.035 |
| 4.409999999999843 | 0.049 | 0.043 | 0.035 |
| 4.414999999999844 | 0.049 | 0.043 | 0.035 |
| 4.419999999999843 | 0.049 | 0.042 | 0.035 |
| 4.424999999999843 | 0.049 | 0.042 | 0.035 |
| 4.429999999999843 | 0.048 | 0.042 | 0.035 |
| 4.434999999999843 | 0.048 | 0.042 | 0.035 |
| 4.439999999999843 | 0.048 | 0.042 | 0.035 |
| 4.444999999999843 | 0.048 | 0.042 | 0.035 |
| 4.449999999999842 | 0.048 | 0.042 | 0.035 |
| 4.454999999999843 | 0.048 | 0.042 | 0.035 |
| 4.459999999999842 | 0.048 | 0.042 | 0.035 |
| 4.464999999999843 | 0.048 | 0.042 | 0.035 |
| 4.469999999999842 | 0.048 | 0.042 | 0.035 |
| 4.474999999999842 | 0.048 | 0.042 | 0.034 |
| 4.479999999999842 | 0.047 | 0.042 | 0.034 |
| 4.484999999999842 | 0.047 | 0.041 | 0.034 |
| 4.489999999999842 | 0.047 | 0.041 | 0.034 |
| 4.494999999999842 | 0.047 | 0.041 | 0.034 |
| 4.499999999999841 | 0.047 | 0.041 | 0.034 |
| 4.504999999999842 | 0.047 | 0.041 | 0.034 |
| 4.509999999999841 | 0.047 | 0.041 | 0.034 |
| 4.514999999999842 | 0.047 | 0.041 | 0.034 |
| 4.519999999999841 | 0.047 | 0.041 | 0.034 |
| 4.524999999999841 | 0.047 | 0.041 | 0.034 |
| 4.529999999999841 | 0.046 | 0.041 | 0.034 |
| 4.534999999999841 | 0.046 | 0.041 | 0.034 |
| 4.53999999999984 | 0.046 | 0.041 | 0.034 |
| 4.544999999999841 | 0.046 | 0.041 | 0.034 |
| 4.54999999999984 | 0.046 | 0.04 | 0.034 |
| 4.554999999999841 | 0.046 | 0.04 | 0.034 |
| 4.55999999999984 | 0.046 | 0.04 | 0.034 |
| 4.564999999999841 | 0.046 | 0.04 | 0.034 |
| 4.56999999999984 | 0.046 | 0.04 | 0.033 |
| 4.57499999999984 | 0.046 | 0.04 | 0.033 |
| 4.57999999999984 | 0.046 | 0.04 | 0.033 |
| 4.58499999999984 | 0.045 | 0.04 | 0.033 |
| 4.58999999999984 | 0.045 | 0.04 | 0.033 |
| 4.59499999999984 | 0.045 | 0.04 | 0.033 |
| 4.59999999999984 | 0.045 | 0.04 | 0.033 |
| 4.60499999999984 | 0.045 | 0.04 | 0.033 |
| 4.60999999999984 | 0.045 | 0.04 | 0.033 |
| 4.614999999999839 | 0.045 | 0.04 | 0.033 |
| 4.61999999999984 | 0.045 | 0.039 | 0.033 |
| 4.624999999999839 | 0.045 | 0.039 | 0.033 |
| 4.62999999999984 | 0.045 | 0.039 | 0.033 |
| 4.634999999999839 | 0.044 | 0.039 | 0.033 |
| 4.639999999999838 | 0.044 | 0.039 | 0.033 |
| 4.644999999999839 | 0.044 | 0.039 | 0.033 |
| 4.649999999999838 | 0.044 | 0.039 | 0.033 |
| 4.654999999999839 | 0.044 | 0.039 | 0.033 |
| 4.659999999999838 | 0.044 | 0.039 | 0.033 |
| 4.664999999999838 | 0.044 | 0.039 | 0.033 |
| 4.669999999999838 | 0.044 | 0.039 | 0.032 |
| 4.674999999999838 | 0.044 | 0.039 | 0.032 |
| 4.679999999999837 | 0.044 | 0.039 | 0.032 |
| 4.684999999999838 | 0.044 | 0.039 | 0.032 |
| 4.689999999999837 | 0.043 | 0.038 | 0.032 |
| 4.694999999999838 | 0.043 | 0.038 | 0.032 |
| 4.699999999999837 | 0.043 | 0.038 | 0.032 |
| 4.704999999999837 | 0.043 | 0.038 | 0.032 |
| 4.709999999999837 | 0.043 | 0.038 | 0.032 |
| 4.714999999999837 | 0.043 | 0.038 | 0.032 |
| 4.719999999999837 | 0.043 | 0.038 | 0.032 |
| 4.724999999999837 | 0.043 | 0.038 | 0.032 |
| 4.729999999999836 | 0.043 | 0.038 | 0.032 |
| 4.734999999999836 | 0.043 | 0.038 | 0.032 |
| 4.739999999999836 | 0.043 | 0.038 | 0.032 |
| 4.744999999999836 | 0.043 | 0.038 | 0.032 |
| 4.749999999999836 | 0.042 | 0.038 | 0.032 |
| 4.754999999999836 | 0.042 | 0.038 | 0.032 |
| 4.759999999999836 | 0.042 | 0.038 | 0.032 |
| 4.764999999999836 | 0.042 | 0.037 | 0.032 |
| 4.769999999999836 | 0.042 | 0.037 | 0.031 |
| 4.774999999999835 | 0.042 | 0.037 | 0.031 |
| 4.779999999999835 | 0.042 | 0.037 | 0.031 |
| 4.784999999999835 | 0.042 | 0.037 | 0.031 |
| 4.789999999999835 | 0.042 | 0.037 | 0.031 |
| 4.794999999999835 | 0.042 | 0.037 | 0.031 |
| 4.799999999999835 | 0.042 | 0.037 | 0.031 |
| 4.804999999999835 | 0.042 | 0.037 | 0.031 |
| 4.809999999999835 | 0.041 | 0.037 | 0.031 |
| 4.814999999999835 | 0.041 | 0.037 | 0.031 |
| 4.819999999999835 | 0.041 | 0.037 | 0.031 |
| 4.824999999999835 | 0.041 | 0.037 | 0.031 |
| 4.829999999999834 | 0.041 | 0.037 | 0.031 |
| 4.834999999999834 | 0.041 | 0.037 | 0.031 |
| 4.839999999999834 | 0.041 | 0.036 | 0.031 |
| 4.844999999999834 | 0.041 | 0.036 | 0.031 |
| 4.849999999999834 | 0.041 | 0.036 | 0.031 |
| 4.854999999999834 | 0.041 | 0.036 | 0.031 |
| 4.859999999999834 | 0.041 | 0.036 | 0.031 |
| 4.864999999999834 | 0.041 | 0.036 | 0.031 |
| 4.869999999999834 | 0.04 | 0.036 | 0.031 |
| 4.874999999999834 | 0.04 | 0.036 | 0.031 |
| 4.879999999999833 | 0.04 | 0.036 | 0.03 |
| 4.884999999999834 | 0.04 | 0.036 | 0.03 |
| 4.889999999999833 | 0.04 | 0.036 | 0.03 |
| 4.894999999999833 | 0.04 | 0.036 | 0.03 |
| 4.899999999999833 | 0.04 | 0.036 | 0.03 |
| 4.904999999999833 | 0.04 | 0.036 | 0.03 |
| 4.909999999999833 | 0.04 | 0.036 | 0.03 |
| 4.914999999999833 | 0.04 | 0.036 | 0.03 |
| 4.919999999999832 | 0.04 | 0.035 | 0.03 |
| 4.924999999999833 | 0.04 | 0.035 | 0.03 |
| 4.929999999999832 | 0.04 | 0.035 | 0.03 |
| 4.934999999999832 | 0.039 | 0.035 | 0.03 |
| 4.939999999999832 | 0.039 | 0.035 | 0.03 |
| 4.944999999999832 | 0.039 | 0.035 | 0.03 |
| 4.949999999999832 | 0.039 | 0.035 | 0.03 |
| 4.954999999999832 | 0.039 | 0.035 | 0.03 |
| 4.959999999999832 | 0.039 | 0.035 | 0.03 |
| 4.964999999999832 | 0.039 | 0.035 | 0.03 |
| 4.969999999999831 | 0.039 | 0.035 | 0.03 |
| 4.974999999999831 | 0.039 | 0.035 | 0.03 |
| 4.97999999999983 | 0.039 | 0.035 | 0.03 |
| 4.984999999999831 | 0.039 | 0.035 | 0.03 |
| 4.98999999999983 | 0.039 | 0.035 | 0.029 |
| 4.994999999999831 | 0.039 | 0.035 | 0.029 |
| 4.99999999999983 | 0.038 | 0.034 | 0.029 |